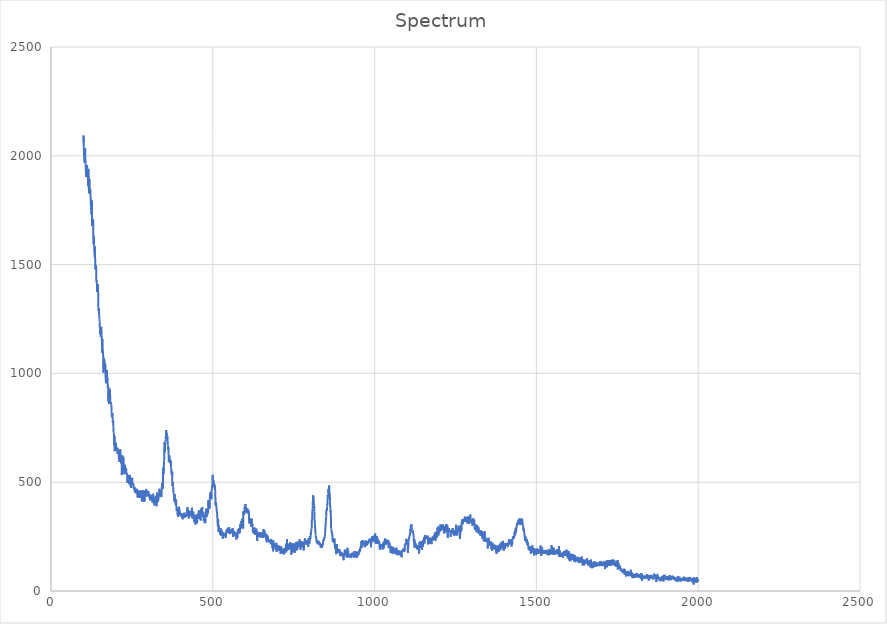
| Category | Spectrum |
|---|---|
| 100.0 | 2060.669 |
| 100.69167 | 2093.079 |
| 101.38332 | 2038.651 |
| 102.07499 | 2003.418 |
| 102.76665 | 1990.29 |
| 103.45832 | 1979.503 |
| 104.14998 | 1967.584 |
| 104.84164 | 2005.34 |
| 105.53331 | 2034.819 |
| 106.22498 | 1983.827 |
| 106.91663 | 1964.356 |
| 107.6083 | 1939.92 |
| 108.29996 | 1903.308 |
| 108.99163 | 1940.898 |
| 109.68329 | 1905.542 |
| 110.37495 | 1957.451 |
| 111.06662 | 1953.255 |
| 111.75829 | 1947.779 |
| 112.44994 | 1944.759 |
| 113.14161 | 1901.045 |
| 113.83327 | 1915.794 |
| 114.52493 | 1862.739 |
| 115.2166 | 1924.685 |
| 115.90826 | 1937.913 |
| 116.59993 | 1880.462 |
| 117.29159 | 1828.373 |
| 117.98325 | 1849.95 |
| 118.67492 | 1892.53 |
| 119.36658 | 1845.512 |
| 120.05824 | 1826.026 |
| 120.74991 | 1840.101 |
| 121.44157 | 1848.503 |
| 122.13324 | 1816.528 |
| 122.8249 | 1801.344 |
| 123.51656 | 1763.043 |
| 124.20823 | 1751.386 |
| 124.89989 | 1729.917 |
| 125.59155 | 1738.966 |
| 126.28322 | 1796.117 |
| 126.97488 | 1677.097 |
| 127.66654 | 1681.862 |
| 128.35822 | 1683 |
| 129.04987 | 1691.173 |
| 129.74153 | 1708.938 |
| 130.4332 | 1699.943 |
| 131.12486 | 1603.884 |
| 131.81653 | 1595.427 |
| 132.50819 | 1629.954 |
| 133.19986 | 1586.966 |
| 133.89153 | 1562.523 |
| 134.58318 | 1563.389 |
| 135.27484 | 1536.543 |
| 135.96651 | 1583.035 |
| 136.65817 | 1486.194 |
| 137.34984 | 1477.481 |
| 138.0415 | 1487.698 |
| 138.73317 | 1496.606 |
| 139.42482 | 1488.011 |
| 140.11649 | 1427.234 |
| 140.80815 | 1423.414 |
| 141.49982 | 1427.916 |
| 142.19148 | 1385.538 |
| 142.88315 | 1373.794 |
| 143.57481 | 1389.38 |
| 144.26648 | 1380.942 |
| 144.95813 | 1410.189 |
| 145.6498 | 1374.033 |
| 146.34146 | 1303.196 |
| 147.03313 | 1287.864 |
| 147.72479 | 1300 |
| 148.41646 | 1290.059 |
| 149.10812 | 1255.666 |
| 149.79977 | 1246.336 |
| 150.49144 | 1238.93 |
| 151.18311 | 1203.133 |
| 151.87477 | 1181.33 |
| 152.56644 | 1186.363 |
| 153.2581 | 1194.689 |
| 153.94977 | 1168.537 |
| 154.64143 | 1199.528 |
| 155.33308 | 1214.484 |
| 156.02475 | 1186.503 |
| 156.71642 | 1162.122 |
| 157.40808 | 1142.733 |
| 158.09975 | 1093.35 |
| 158.79141 | 1158.336 |
| 159.48308 | 1103.729 |
| 160.17474 | 1107.098 |
| 160.86639 | 1100.533 |
| 161.55806 | 1050.695 |
| 162.24973 | 1003.31 |
| 162.94139 | 1062.484 |
| 163.63306 | 1069.717 |
| 164.32472 | 1062.939 |
| 165.01639 | 1059.902 |
| 165.70804 | 1053.103 |
| 166.3997 | 1036.112 |
| 167.09137 | 1019.361 |
| 167.78304 | 1041.879 |
| 168.4747 | 983.18 |
| 169.16637 | 978.833 |
| 169.85803 | 954.608 |
| 170.5497 | 967.212 |
| 171.24135 | 1003.831 |
| 171.93301 | 979.055 |
| 172.62468 | 1016.555 |
| 173.31635 | 956.608 |
| 174.00801 | 981.861 |
| 174.69968 | 966.576 |
| 175.39134 | 932.014 |
| 176.08299 | 931.723 |
| 176.77466 | 941.477 |
| 177.46632 | 869.064 |
| 178.15799 | 920.84 |
| 178.84966 | 895.791 |
| 179.54132 | 859.845 |
| 180.23299 | 875.432 |
| 180.92465 | 930.143 |
| 181.6163 | 926.14 |
| 182.30797 | 918.877 |
| 182.99963 | 884.642 |
| 183.6913 | 862.061 |
| 184.38297 | 859.742 |
| 185.07463 | 864.307 |
| 185.7663 | 860.186 |
| 186.45795 | 857.897 |
| 187.14961 | 824.621 |
| 187.84128 | 806.863 |
| 188.53294 | 798.259 |
| 189.22461 | 809.494 |
| 189.91628 | 817.776 |
| 190.60794 | 789.178 |
| 191.29961 | 771.684 |
| 191.99126 | 784.62 |
| 192.68292 | 757.232 |
| 193.37459 | 729.534 |
| 194.06625 | 724.877 |
| 194.75792 | 716.482 |
| 195.44958 | 669.499 |
| 196.14125 | 712.64 |
| 196.8329 | 642.738 |
| 197.52457 | 668.673 |
| 198.21623 | 674.841 |
| 198.9079 | 671.297 |
| 199.59956 | 683.379 |
| 200.29123 | 681.724 |
| 200.98289 | 646.623 |
| 201.67456 | 660.098 |
| 202.36621 | 651.417 |
| 203.05788 | 658.171 |
| 203.74954 | 658.576 |
| 204.44121 | 645.797 |
| 205.13287 | 657.848 |
| 205.82454 | 629.608 |
| 206.5162 | 652.655 |
| 207.20787 | 646.552 |
| 207.89952 | 638.16 |
| 208.59119 | 641.858 |
| 209.28285 | 639.798 |
| 209.97452 | 602.743 |
| 210.66618 | 614.297 |
| 211.35785 | 593.254 |
| 212.04951 | 629.446 |
| 212.74117 | 637.24 |
| 213.43283 | 638.587 |
| 214.1245 | 651.598 |
| 214.81616 | 621.461 |
| 215.50783 | 625.751 |
| 216.19949 | 607.838 |
| 216.89116 | 586.53 |
| 217.58282 | 601.581 |
| 218.27448 | 581.55 |
| 218.96614 | 534.54 |
| 219.65781 | 599.083 |
| 220.34947 | 608.519 |
| 221.04114 | 622.856 |
| 221.7328 | 596.686 |
| 222.42447 | 571.057 |
| 223.11612 | 584.854 |
| 223.80779 | 613.239 |
| 224.49945 | 583.223 |
| 225.19112 | 553.615 |
| 225.88278 | 557.053 |
| 226.57445 | 536.7 |
| 227.26611 | 551.578 |
| 227.95778 | 579.703 |
| 228.64943 | 578.664 |
| 229.34109 | 544.195 |
| 230.03276 | 542.036 |
| 230.72443 | 547.913 |
| 231.41609 | 565.915 |
| 232.10776 | 562.261 |
| 232.79942 | 546.129 |
| 233.49107 | 537.797 |
| 234.18274 | 541.615 |
| 234.8744 | 530.483 |
| 235.56607 | 527.04 |
| 236.25774 | 496.276 |
| 236.9494 | 516.238 |
| 237.64107 | 533.724 |
| 238.33273 | 529.285 |
| 239.02438 | 527.905 |
| 239.71605 | 512.699 |
| 240.40771 | 504.946 |
| 241.09938 | 501.73 |
| 241.79105 | 490.804 |
| 242.48271 | 507.31 |
| 243.17438 | 533.2 |
| 243.86604 | 530.515 |
| 244.55769 | 511.714 |
| 245.24936 | 521.199 |
| 245.94102 | 480.561 |
| 246.63269 | 484.822 |
| 247.32436 | 480.404 |
| 248.01602 | 473.409 |
| 248.70769 | 488.815 |
| 249.39934 | 510.414 |
| 250.091 | 497.048 |
| 250.78267 | 520.105 |
| 251.47433 | 497.35 |
| 252.166 | 493.044 |
| 252.85767 | 495.538 |
| 253.54933 | 492.391 |
| 254.241 | 496.125 |
| 254.93265 | 481.968 |
| 255.62431 | 478.514 |
| 256.31598 | 466.609 |
| 257.00766 | 470.593 |
| 257.69931 | 478.316 |
| 258.39096 | 470.859 |
| 259.08264 | 454.114 |
| 259.77429 | 470.65 |
| 260.46597 | 457.245 |
| 261.15762 | 461.888 |
| 261.8493 | 448.909 |
| 262.54095 | 459.498 |
| 263.2326 | 468.853 |
| 263.92429 | 459.168 |
| 264.61594 | 470.236 |
| 265.30762 | 468.066 |
| 265.99927 | 453.329 |
| 266.69095 | 457.191 |
| 267.3826 | 430.4 |
| 268.07425 | 433.236 |
| 268.76593 | 462.385 |
| 269.45758 | 449.497 |
| 270.14926 | 427.292 |
| 270.84091 | 435.084 |
| 271.53259 | 459.684 |
| 272.22424 | 452.185 |
| 272.91589 | 455.685 |
| 273.60757 | 458.191 |
| 274.29922 | 446.508 |
| 274.99091 | 461.359 |
| 275.68256 | 428.435 |
| 276.37424 | 449.403 |
| 277.06589 | 459.927 |
| 277.75757 | 458.003 |
| 278.44922 | 456.662 |
| 279.14087 | 459.059 |
| 279.83255 | 450.489 |
| 280.5242 | 412.461 |
| 281.21588 | 411.15 |
| 281.90753 | 435.962 |
| 282.59921 | 421.589 |
| 283.29086 | 437.687 |
| 283.98251 | 462.657 |
| 284.67419 | 448.154 |
| 285.36584 | 421.284 |
| 286.05753 | 431.71 |
| 286.74918 | 427.781 |
| 287.44086 | 411.338 |
| 288.13251 | 421.261 |
| 288.82416 | 413.002 |
| 289.51584 | 411.894 |
| 290.20749 | 461.346 |
| 290.89917 | 457.782 |
| 291.59082 | 446.49 |
| 292.2825 | 432.397 |
| 292.97415 | 448.237 |
| 293.6658 | 460.403 |
| 294.35748 | 466.731 |
| 295.04913 | 466.886 |
| 295.74081 | 450.579 |
| 296.43246 | 451.068 |
| 297.12415 | 456.29 |
| 297.8158 | 455.497 |
| 298.50748 | 447.54 |
| 299.19913 | 434.639 |
| 299.89078 | 435.774 |
| 300.58246 | 454.98 |
| 301.27411 | 459.197 |
| 301.96579 | 439.589 |
| 302.65744 | 434.366 |
| 303.34912 | 434.225 |
| 304.04077 | 433.624 |
| 304.73242 | 427.052 |
| 305.4241 | 421.971 |
| 306.11575 | 429.901 |
| 306.80743 | 443.28 |
| 307.49908 | 415.807 |
| 308.19077 | 429.478 |
| 308.88242 | 421.003 |
| 309.57407 | 433.914 |
| 310.26575 | 437.971 |
| 310.9574 | 429.134 |
| 311.64908 | 440.047 |
| 312.34073 | 434.701 |
| 313.03241 | 419.421 |
| 313.72406 | 406.931 |
| 314.41574 | 429.204 |
| 315.10739 | 446.826 |
| 315.79904 | 444.459 |
| 316.49072 | 431.488 |
| 317.18237 | 419.342 |
| 317.87405 | 402.528 |
| 318.5657 | 419.123 |
| 319.25739 | 411.714 |
| 319.94904 | 393.149 |
| 320.64069 | 406.125 |
| 321.33237 | 423.237 |
| 322.02402 | 415.507 |
| 322.7157 | 410.562 |
| 323.40735 | 437.563 |
| 324.09903 | 413.084 |
| 324.79068 | 435.607 |
| 325.48233 | 407.424 |
| 326.17401 | 389.565 |
| 326.86566 | 398.591 |
| 327.55734 | 421.318 |
| 328.24899 | 452.397 |
| 328.94067 | 429.504 |
| 329.63232 | 429.058 |
| 330.32397 | 408.453 |
| 331.01566 | 415.36 |
| 331.70731 | 419.931 |
| 332.39899 | 426.672 |
| 333.09064 | 439.773 |
| 333.78232 | 435.992 |
| 334.47397 | 451.788 |
| 335.16565 | 469.733 |
| 335.8573 | 449.432 |
| 336.54895 | 444.105 |
| 337.24063 | 445.779 |
| 337.93228 | 441.018 |
| 338.62396 | 436.806 |
| 339.31561 | 450.248 |
| 340.00729 | 459.837 |
| 340.69894 | 432.217 |
| 341.39059 | 431.718 |
| 342.08228 | 464.743 |
| 342.77393 | 480.683 |
| 343.46561 | 486.823 |
| 344.15726 | 498.643 |
| 344.84894 | 495.651 |
| 345.54059 | 468.242 |
| 346.23224 | 543.694 |
| 346.92392 | 566.057 |
| 347.61557 | 536.5 |
| 348.30725 | 558.066 |
| 348.9989 | 583.338 |
| 349.69058 | 599.256 |
| 350.38223 | 660.978 |
| 351.07391 | 684.833 |
| 351.76556 | 637.805 |
| 352.45721 | 665.128 |
| 353.1489 | 682.425 |
| 353.84055 | 687.573 |
| 354.53223 | 695.231 |
| 355.22388 | 718.544 |
| 355.91556 | 739.83 |
| 356.60721 | 710.695 |
| 357.29886 | 727.395 |
| 357.99054 | 704.712 |
| 358.68219 | 695.782 |
| 359.37387 | 711.261 |
| 360.06552 | 697.995 |
| 360.7572 | 673.648 |
| 361.44885 | 669.285 |
| 362.1405 | 648.742 |
| 362.83218 | 660.834 |
| 363.52383 | 625.169 |
| 364.21552 | 592.58 |
| 364.90717 | 622.053 |
| 365.59885 | 624.076 |
| 366.2905 | 614.316 |
| 366.98215 | 613.964 |
| 367.67383 | 587.762 |
| 368.36548 | 594.317 |
| 369.05716 | 600.049 |
| 369.74881 | 600.509 |
| 370.44049 | 599.466 |
| 371.13214 | 568.641 |
| 371.82382 | 546.231 |
| 372.51547 | 542.487 |
| 373.20712 | 533.53 |
| 373.8988 | 531.923 |
| 374.59045 | 549.139 |
| 375.28214 | 483.097 |
| 375.97379 | 499.692 |
| 376.66547 | 495.208 |
| 377.35712 | 478.862 |
| 378.04877 | 462.989 |
| 378.74045 | 449.823 |
| 379.4321 | 448.156 |
| 380.12378 | 448.18 |
| 380.81543 | 429.653 |
| 381.50711 | 410.299 |
| 382.19876 | 444.488 |
| 382.89041 | 433.765 |
| 383.58209 | 406.834 |
| 384.27374 | 409.43 |
| 384.96542 | 419.956 |
| 385.65707 | 394.718 |
| 386.34875 | 422.124 |
| 387.04041 | 401.587 |
| 387.73209 | 377.365 |
| 388.42374 | 368.905 |
| 389.11539 | 380.032 |
| 389.80707 | 382.857 |
| 390.49872 | 364.728 |
| 391.1904 | 351.007 |
| 391.88205 | 356.915 |
| 392.57373 | 340.985 |
| 393.26538 | 344.976 |
| 393.95703 | 353.858 |
| 394.64871 | 379.187 |
| 395.34036 | 387.465 |
| 396.03204 | 379.952 |
| 396.72369 | 377.091 |
| 397.41537 | 369.048 |
| 398.10703 | 354.237 |
| 398.79868 | 362.2 |
| 399.49036 | 347.466 |
| 400.18201 | 345.559 |
| 400.87369 | 353.332 |
| 401.56534 | 348.06 |
| 402.25702 | 344.708 |
| 402.94867 | 357.624 |
| 403.64032 | 341.681 |
| 404.332 | 346.995 |
| 405.02365 | 334.597 |
| 405.71533 | 343.047 |
| 406.40698 | 334.46 |
| 407.09866 | 332.059 |
| 407.79031 | 341.069 |
| 408.48199 | 346.759 |
| 409.17365 | 345.218 |
| 409.8653 | 355.421 |
| 410.55698 | 335.895 |
| 411.24863 | 359.874 |
| 411.94031 | 355.544 |
| 412.63196 | 349.125 |
| 413.32364 | 337.664 |
| 414.01529 | 340.043 |
| 414.70694 | 350.338 |
| 415.39862 | 342.97 |
| 416.09027 | 351 |
| 416.78195 | 351 |
| 417.4736 | 351.862 |
| 418.16528 | 340.366 |
| 418.85693 | 356.658 |
| 419.54858 | 363.242 |
| 420.24026 | 351.482 |
| 420.93192 | 356.185 |
| 421.6236 | 385.513 |
| 422.31525 | 365.724 |
| 423.00693 | 373.292 |
| 423.69858 | 345.423 |
| 424.39026 | 370.386 |
| 425.08191 | 358.461 |
| 425.77356 | 333.72 |
| 426.46524 | 343.854 |
| 427.15689 | 363.306 |
| 427.84857 | 347.272 |
| 428.54022 | 368 |
| 429.2319 | 368 |
| 429.92355 | 358.836 |
| 430.6152 | 364.394 |
| 431.30688 | 357.651 |
| 431.99854 | 343.712 |
| 432.69022 | 344.306 |
| 433.38187 | 350.903 |
| 434.07355 | 343.274 |
| 434.7652 | 350.016 |
| 435.45685 | 382.491 |
| 436.14853 | 368.214 |
| 436.84018 | 333.141 |
| 437.53186 | 332.793 |
| 438.22351 | 341.544 |
| 438.91519 | 353.048 |
| 439.60684 | 361.275 |
| 440.29849 | 359.369 |
| 440.99017 | 356.076 |
| 441.68182 | 327.716 |
| 442.3735 | 318.794 |
| 443.06516 | 316.374 |
| 443.75684 | 332.239 |
| 444.44849 | 345.893 |
| 445.14017 | 345.836 |
| 445.83182 | 324.465 |
| 446.52347 | 305.649 |
| 447.21515 | 325.593 |
| 447.9068 | 327.694 |
| 448.59848 | 351.397 |
| 449.29013 | 346.117 |
| 449.98181 | 329.365 |
| 450.67346 | 311.227 |
| 451.36511 | 313.053 |
| 452.05679 | 328.035 |
| 452.74844 | 339.11 |
| 453.44012 | 346.16 |
| 454.13177 | 356.469 |
| 454.82346 | 331.527 |
| 455.51511 | 337.793 |
| 456.20676 | 346.429 |
| 456.89844 | 369.809 |
| 457.59009 | 348.091 |
| 458.28177 | 335.523 |
| 458.97342 | 341.301 |
| 459.6651 | 332.373 |
| 460.35675 | 335.336 |
| 461.04843 | 353.719 |
| 461.74008 | 372.535 |
| 462.43173 | 324.282 |
| 463.12341 | 352.005 |
| 463.81506 | 378.598 |
| 464.50674 | 373.636 |
| 465.19839 | 365.536 |
| 465.89008 | 366.225 |
| 466.58173 | 366.481 |
| 467.27338 | 386.099 |
| 467.96506 | 354.115 |
| 468.65671 | 359.948 |
| 469.34839 | 340.24 |
| 470.04004 | 348.253 |
| 470.73172 | 363.788 |
| 471.42337 | 344.927 |
| 472.11502 | 322.496 |
| 472.8067 | 334.391 |
| 473.49835 | 349.873 |
| 474.19003 | 338.266 |
| 474.88168 | 311.36 |
| 475.57336 | 320.312 |
| 476.26501 | 328.567 |
| 476.95667 | 314.831 |
| 477.64835 | 337.936 |
| 478.34 | 349.003 |
| 479.03168 | 354.328 |
| 479.72333 | 378.599 |
| 480.41501 | 361.985 |
| 481.10666 | 339.616 |
| 481.79834 | 359.851 |
| 482.48999 | 367.886 |
| 483.18164 | 377.446 |
| 483.87332 | 361.322 |
| 484.56497 | 355.965 |
| 485.25665 | 359.703 |
| 485.9483 | 385.515 |
| 486.63998 | 418.176 |
| 487.33163 | 391.767 |
| 488.02328 | 410.141 |
| 488.71497 | 398 |
| 489.40662 | 403.979 |
| 490.0983 | 378.262 |
| 490.78995 | 422.085 |
| 491.48163 | 447.659 |
| 492.17328 | 444.453 |
| 492.86493 | 448.07 |
| 493.55661 | 456.327 |
| 494.24826 | 445.931 |
| 494.93994 | 436.863 |
| 495.63159 | 421.546 |
| 496.32327 | 458.81 |
| 497.01492 | 471.819 |
| 497.7066 | 474.342 |
| 498.39825 | 471.353 |
| 499.0899 | 508.621 |
| 499.78159 | 534.459 |
| 500.47324 | 497.146 |
| 501.16492 | 484.105 |
| 501.85657 | 509.149 |
| 502.54825 | 477.578 |
| 503.2399 | 481.428 |
| 503.93155 | 489.492 |
| 504.62323 | 493.918 |
| 505.31488 | 483.148 |
| 506.00656 | 483.913 |
| 506.69821 | 482.861 |
| 507.38989 | 456.392 |
| 508.08154 | 422.376 |
| 508.77319 | 392.422 |
| 509.46487 | 408.431 |
| 510.15652 | 400.745 |
| 510.84821 | 388.181 |
| 511.53986 | 378.664 |
| 512.23151 | 366.645 |
| 512.92322 | 360.473 |
| 513.61487 | 350.31 |
| 514.30652 | 330.646 |
| 514.99817 | 311.399 |
| 515.68982 | 298.922 |
| 516.38153 | 330.3 |
| 517.07318 | 306.762 |
| 517.76483 | 272.541 |
| 518.45648 | 301.22 |
| 519.14813 | 281.752 |
| 519.83984 | 281.335 |
| 520.53149 | 278.481 |
| 521.22314 | 273.458 |
| 521.91479 | 282.953 |
| 522.60651 | 262.765 |
| 523.29816 | 258.761 |
| 523.98981 | 270.538 |
| 524.68146 | 288.645 |
| 525.37311 | 265.702 |
| 526.06482 | 252.812 |
| 526.75647 | 274.672 |
| 527.44812 | 280.486 |
| 528.13977 | 267.042 |
| 528.83148 | 259.832 |
| 529.52313 | 261.255 |
| 530.21478 | 262.132 |
| 530.90643 | 240.323 |
| 531.59808 | 266.606 |
| 532.28979 | 270.138 |
| 532.98145 | 254.85 |
| 533.6731 | 251.539 |
| 534.36475 | 257.682 |
| 535.0564 | 261.005 |
| 535.74811 | 259.887 |
| 536.43976 | 258.681 |
| 537.13141 | 259.477 |
| 537.82306 | 263.699 |
| 538.51477 | 258.509 |
| 539.20642 | 258.509 |
| 539.89807 | 243.914 |
| 540.58972 | 252.249 |
| 541.28137 | 262.261 |
| 541.97308 | 276.599 |
| 542.66473 | 279.096 |
| 543.35638 | 272.103 |
| 544.04803 | 275.269 |
| 544.73975 | 286.124 |
| 545.4314 | 281.79 |
| 546.12305 | 274.194 |
| 546.8147 | 290.995 |
| 547.50635 | 280.025 |
| 548.19806 | 275.329 |
| 548.88971 | 266.417 |
| 549.58136 | 285.287 |
| 550.27301 | 293.853 |
| 550.96466 | 277.531 |
| 551.65637 | 261.863 |
| 552.34802 | 261.493 |
| 553.03967 | 283.332 |
| 553.73132 | 278.536 |
| 554.42303 | 268.981 |
| 555.11469 | 281.042 |
| 555.80634 | 279.517 |
| 556.49799 | 278.16 |
| 557.18964 | 275.913 |
| 557.88135 | 273.492 |
| 558.573 | 272.929 |
| 559.26465 | 272.679 |
| 559.9563 | 268.087 |
| 560.64795 | 263.936 |
| 561.33966 | 289.537 |
| 562.03131 | 269.027 |
| 562.72296 | 248.498 |
| 563.41461 | 263.232 |
| 564.10632 | 270.713 |
| 564.79797 | 266.687 |
| 565.48962 | 271.573 |
| 566.18127 | 272.216 |
| 566.87292 | 264.147 |
| 567.56464 | 265.434 |
| 568.25629 | 267.504 |
| 568.94794 | 255.417 |
| 569.63959 | 263.371 |
| 570.3313 | 254.239 |
| 571.02295 | 250.988 |
| 571.7146 | 268.194 |
| 572.40625 | 253.353 |
| 573.0979 | 236.34 |
| 573.78961 | 250.989 |
| 574.48126 | 268.765 |
| 575.17291 | 258.448 |
| 575.86456 | 244.684 |
| 576.55621 | 253.652 |
| 577.24792 | 282.842 |
| 577.93958 | 280.565 |
| 578.63123 | 269.805 |
| 579.32288 | 278.995 |
| 580.01459 | 276.461 |
| 580.70624 | 288.5 |
| 581.39789 | 275.85 |
| 582.08954 | 266.689 |
| 582.78119 | 268.834 |
| 583.4729 | 266.173 |
| 584.16455 | 290.181 |
| 584.8562 | 307.893 |
| 585.54785 | 309.387 |
| 586.23956 | 285.584 |
| 586.93121 | 295.431 |
| 587.62286 | 292.259 |
| 588.31451 | 322.066 |
| 589.00616 | 314.449 |
| 589.69788 | 320.611 |
| 590.38953 | 329.221 |
| 591.08118 | 326.269 |
| 591.77283 | 330.96 |
| 592.46448 | 318.509 |
| 593.15619 | 314.261 |
| 593.84784 | 286.934 |
| 594.53949 | 367.149 |
| 595.23114 | 354.415 |
| 595.92285 | 359.9 |
| 596.6145 | 350.673 |
| 597.30615 | 349.446 |
| 597.9978 | 373.221 |
| 598.68945 | 388.745 |
| 599.38116 | 375.277 |
| 600.07281 | 373.044 |
| 600.76447 | 400.221 |
| 601.45612 | 375.098 |
| 602.14783 | 384.276 |
| 602.83948 | 362.241 |
| 603.53113 | 359.282 |
| 604.22278 | 372.717 |
| 604.91443 | 375.644 |
| 605.60614 | 367.127 |
| 606.29779 | 373.498 |
| 606.98944 | 379.351 |
| 607.68109 | 370.885 |
| 608.37274 | 364.917 |
| 609.06445 | 365.428 |
| 609.7561 | 354.456 |
| 610.44775 | 371.789 |
| 611.1394 | 363.501 |
| 611.83112 | 344.192 |
| 612.52277 | 314.776 |
| 613.21442 | 310.27 |
| 613.90607 | 330.251 |
| 614.59772 | 332.899 |
| 615.28943 | 331.639 |
| 615.98108 | 331.189 |
| 616.67273 | 324.823 |
| 617.36438 | 320.293 |
| 618.05609 | 313.604 |
| 618.74774 | 295.642 |
| 619.43939 | 304.905 |
| 620.13104 | 332.558 |
| 620.82269 | 297.945 |
| 621.5144 | 302.828 |
| 622.20605 | 308.665 |
| 622.89771 | 301.825 |
| 623.58936 | 274.452 |
| 624.28101 | 269.726 |
| 624.97272 | 289.575 |
| 625.66437 | 285.435 |
| 626.35602 | 266.272 |
| 627.04767 | 284.867 |
| 627.73938 | 262.601 |
| 628.43103 | 279.559 |
| 629.12268 | 280.935 |
| 629.81433 | 288.907 |
| 630.50598 | 288.397 |
| 631.19769 | 257.91 |
| 631.88934 | 272.78 |
| 632.58099 | 261.562 |
| 633.27264 | 262.311 |
| 633.96429 | 286.904 |
| 634.65601 | 285.63 |
| 635.34766 | 273.508 |
| 636.03931 | 272.538 |
| 636.73096 | 243.114 |
| 637.42267 | 230.333 |
| 638.11432 | 273.786 |
| 638.80597 | 247.095 |
| 639.49762 | 265.453 |
| 640.18927 | 266.826 |
| 640.88098 | 263.85 |
| 641.57263 | 256.849 |
| 642.26428 | 251.486 |
| 642.95593 | 254.877 |
| 643.64764 | 257.612 |
| 644.33929 | 254.951 |
| 645.03094 | 263.454 |
| 645.7226 | 269.8 |
| 646.41425 | 252.645 |
| 647.10596 | 247.561 |
| 647.79761 | 246.126 |
| 648.48926 | 268.339 |
| 649.18091 | 246.743 |
| 649.87256 | 265.773 |
| 650.56427 | 261.651 |
| 651.25592 | 265.437 |
| 651.94757 | 260.839 |
| 652.63922 | 247.321 |
| 653.33093 | 257.765 |
| 654.02258 | 266.358 |
| 654.71423 | 262.088 |
| 655.40588 | 256.192 |
| 656.09753 | 243.153 |
| 656.78925 | 284.411 |
| 657.4809 | 253.896 |
| 658.17255 | 249.598 |
| 658.8642 | 255.486 |
| 659.55591 | 278.087 |
| 660.24756 | 259.032 |
| 660.93921 | 260.487 |
| 661.63086 | 267.466 |
| 662.32251 | 260.335 |
| 663.01422 | 262.064 |
| 663.70587 | 247.226 |
| 664.39752 | 247.436 |
| 665.08917 | 233.873 |
| 665.78082 | 261.691 |
| 666.47253 | 224.081 |
| 667.16418 | 250.104 |
| 667.85583 | 251.049 |
| 668.54749 | 238.883 |
| 669.2392 | 254.357 |
| 669.93085 | 240.082 |
| 670.6225 | 238.199 |
| 671.31415 | 242.011 |
| 672.0058 | 229.323 |
| 672.69751 | 227.272 |
| 673.38916 | 232.629 |
| 674.08081 | 225.369 |
| 674.77246 | 234.911 |
| 675.46417 | 230.306 |
| 676.15582 | 226.584 |
| 676.84747 | 225.598 |
| 677.53912 | 228.04 |
| 678.23077 | 221.147 |
| 678.92249 | 218.654 |
| 679.61414 | 226.15 |
| 680.30579 | 239.032 |
| 680.99744 | 228.515 |
| 681.68909 | 219.711 |
| 682.3808 | 228.871 |
| 683.07245 | 228.66 |
| 683.7641 | 224.655 |
| 684.45575 | 197.027 |
| 685.14746 | 231.504 |
| 685.83911 | 182.247 |
| 686.53076 | 191.567 |
| 687.22241 | 230.716 |
| 687.91406 | 218.244 |
| 688.60577 | 215.265 |
| 689.29742 | 210.694 |
| 689.98907 | 214.722 |
| 690.68073 | 208.532 |
| 691.37244 | 204.649 |
| 692.06409 | 211.526 |
| 692.75574 | 211.283 |
| 693.44739 | 199.893 |
| 694.13904 | 188.955 |
| 694.83075 | 190.977 |
| 695.5224 | 196.04 |
| 696.21405 | 221.272 |
| 696.9057 | 212.395 |
| 697.59735 | 179.404 |
| 698.28906 | 196.213 |
| 698.98071 | 205.083 |
| 699.67236 | 207.206 |
| 700.36401 | 199.922 |
| 701.05573 | 196.354 |
| 701.74738 | 202.776 |
| 702.43903 | 202.6 |
| 703.13068 | 202.461 |
| 703.82233 | 209.297 |
| 704.51404 | 193.101 |
| 705.20569 | 185.469 |
| 705.89734 | 197.326 |
| 706.58899 | 185.052 |
| 707.28064 | 194.874 |
| 707.97235 | 203.78 |
| 708.664 | 196.772 |
| 709.35565 | 170.026 |
| 710.0473 | 173.772 |
| 710.73901 | 192.917 |
| 711.43066 | 204.15 |
| 712.12231 | 204.603 |
| 712.81396 | 191.004 |
| 713.50562 | 176.544 |
| 714.19733 | 177.345 |
| 714.88898 | 180.317 |
| 715.58063 | 179.019 |
| 716.27228 | 192.342 |
| 716.96399 | 189.095 |
| 717.65564 | 169.454 |
| 718.34729 | 190.09 |
| 719.03894 | 182.238 |
| 719.73059 | 194.789 |
| 720.4223 | 168.761 |
| 721.11395 | 173.989 |
| 721.8056 | 197.344 |
| 722.49725 | 179.61 |
| 723.1889 | 178.732 |
| 723.88062 | 179.286 |
| 724.57227 | 174.777 |
| 725.26392 | 197.521 |
| 725.95557 | 210.384 |
| 726.64728 | 201.912 |
| 727.33893 | 218.23 |
| 728.03058 | 212.201 |
| 728.72223 | 182.496 |
| 729.41388 | 239.23 |
| 730.10559 | 187.536 |
| 730.79724 | 211.057 |
| 731.48889 | 195.94 |
| 732.18054 | 212.659 |
| 732.87225 | 216.884 |
| 733.5639 | 202.751 |
| 734.25555 | 189.046 |
| 734.9472 | 197.445 |
| 735.63885 | 212.282 |
| 736.33057 | 210.674 |
| 737.02222 | 211.253 |
| 737.71387 | 215.673 |
| 738.40552 | 198.635 |
| 739.09717 | 223.771 |
| 739.78888 | 200.685 |
| 740.48053 | 194.747 |
| 741.17218 | 198.52 |
| 741.86383 | 209.821 |
| 742.55554 | 167.122 |
| 743.24719 | 177.232 |
| 743.93884 | 180.509 |
| 744.63049 | 215.422 |
| 745.32214 | 219.349 |
| 746.01385 | 208.927 |
| 746.70551 | 188.211 |
| 747.39716 | 177.863 |
| 748.08881 | 203.634 |
| 748.78052 | 215.896 |
| 749.47217 | 195.875 |
| 750.16382 | 214.705 |
| 750.85547 | 216.895 |
| 751.54712 | 197.457 |
| 752.23883 | 211.517 |
| 752.93048 | 175.699 |
| 753.62213 | 181.367 |
| 754.31378 | 199.911 |
| 755.00543 | 218.366 |
| 755.69714 | 202.808 |
| 756.38879 | 223.754 |
| 757.08044 | 217.339 |
| 757.77209 | 213.9 |
| 758.46381 | 205.517 |
| 759.15546 | 207.829 |
| 759.84711 | 194.711 |
| 760.53876 | 186.765 |
| 761.23041 | 219.129 |
| 761.92212 | 226.893 |
| 762.61377 | 199.73 |
| 763.30542 | 201.319 |
| 763.99707 | 214.935 |
| 764.68878 | 209.245 |
| 765.38043 | 211.333 |
| 766.07208 | 207.547 |
| 766.76373 | 217.809 |
| 767.45538 | 222.925 |
| 768.14709 | 237.198 |
| 768.83875 | 209.348 |
| 769.5304 | 217.142 |
| 770.22205 | 199.033 |
| 770.9137 | 189.786 |
| 771.60541 | 201.385 |
| 772.29706 | 220.008 |
| 772.98871 | 226.834 |
| 773.68036 | 207.44 |
| 774.37207 | 202.36 |
| 775.06372 | 228.623 |
| 775.75537 | 213.755 |
| 776.44702 | 201.892 |
| 777.13867 | 213.126 |
| 777.83038 | 222.938 |
| 778.52203 | 225.769 |
| 779.21368 | 199.237 |
| 779.90533 | 220.629 |
| 780.59698 | 190.437 |
| 781.2887 | 186.509 |
| 781.98035 | 217.221 |
| 782.672 | 222.562 |
| 783.36365 | 221.16 |
| 784.05536 | 232.13 |
| 784.74701 | 242.606 |
| 785.43866 | 227.322 |
| 786.13031 | 219.503 |
| 786.82196 | 226.261 |
| 787.51367 | 219.384 |
| 788.20532 | 216.188 |
| 788.89697 | 219.518 |
| 789.58862 | 213.241 |
| 790.28033 | 229.791 |
| 790.97198 | 216.375 |
| 791.66364 | 233.028 |
| 792.35529 | 217.32 |
| 793.04694 | 212.565 |
| 793.73865 | 232.708 |
| 794.4303 | 217.071 |
| 795.12195 | 202.795 |
| 795.8136 | 240.985 |
| 796.50525 | 229.901 |
| 797.19696 | 242.358 |
| 797.88861 | 242.562 |
| 798.58026 | 217.845 |
| 799.27191 | 232.633 |
| 799.96362 | 251.811 |
| 800.65527 | 247.294 |
| 801.34692 | 239.92 |
| 802.03857 | 248.149 |
| 802.73022 | 266.647 |
| 803.42194 | 260.354 |
| 804.11359 | 278.819 |
| 804.80524 | 284.718 |
| 805.49689 | 288.313 |
| 806.1886 | 328.865 |
| 806.88025 | 321.866 |
| 807.5719 | 368.03 |
| 808.26355 | 374.255 |
| 808.9552 | 391.571 |
| 809.64691 | 439.652 |
| 810.33856 | 436.847 |
| 811.03021 | 434.983 |
| 811.72186 | 426.282 |
| 812.41351 | 402.984 |
| 813.10522 | 391.852 |
| 813.79688 | 365.684 |
| 814.48853 | 332.183 |
| 815.18018 | 312.015 |
| 815.87189 | 298.691 |
| 816.56354 | 285.068 |
| 817.25519 | 259.332 |
| 817.94684 | 255.929 |
| 818.63849 | 246.171 |
| 819.3302 | 247.052 |
| 820.02185 | 237.367 |
| 820.7135 | 226.154 |
| 821.40515 | 232.783 |
| 822.09686 | 223.531 |
| 822.78851 | 219.549 |
| 823.48016 | 224.544 |
| 824.17181 | 228.674 |
| 824.86346 | 218.512 |
| 825.55518 | 217.533 |
| 826.24683 | 223.58 |
| 826.93848 | 228.021 |
| 827.63013 | 221.013 |
| 828.32178 | 226.048 |
| 829.01349 | 217.797 |
| 829.70514 | 211.73 |
| 830.39679 | 218.362 |
| 831.08844 | 219.485 |
| 831.78015 | 211.45 |
| 832.4718 | 209.47 |
| 833.16345 | 201.849 |
| 833.8551 | 200.439 |
| 834.54675 | 216.396 |
| 835.23846 | 199.496 |
| 835.93011 | 208.773 |
| 836.62177 | 211.705 |
| 837.31342 | 198.826 |
| 838.00513 | 200.598 |
| 838.69678 | 216.755 |
| 839.38843 | 213.249 |
| 840.08008 | 213.38 |
| 840.77173 | 223.381 |
| 841.46344 | 234.017 |
| 842.15509 | 233.933 |
| 842.84674 | 234.859 |
| 843.53839 | 235.289 |
| 844.23004 | 246.956 |
| 844.92175 | 243.879 |
| 845.6134 | 247.273 |
| 846.30505 | 249.202 |
| 846.9967 | 263.06 |
| 847.68842 | 283.955 |
| 848.38007 | 300.131 |
| 849.07172 | 316.472 |
| 849.76337 | 322.339 |
| 850.45502 | 341.935 |
| 851.14673 | 374.892 |
| 851.83838 | 372.978 |
| 852.53003 | 368.799 |
| 853.22168 | 388.71 |
| 853.91333 | 398.239 |
| 854.60504 | 408.814 |
| 855.29669 | 441.26 |
| 855.98834 | 431.806 |
| 856.67999 | 436.891 |
| 857.3717 | 469.126 |
| 858.06335 | 453.599 |
| 858.755 | 472.226 |
| 859.44666 | 484.98 |
| 860.13831 | 459.04 |
| 860.83002 | 441.087 |
| 861.52167 | 445.543 |
| 862.21332 | 410.407 |
| 862.90497 | 377.544 |
| 863.59668 | 365.371 |
| 864.28833 | 368.195 |
| 864.97998 | 340.004 |
| 865.67163 | 287.459 |
| 866.36328 | 282.228 |
| 867.05499 | 277.023 |
| 867.74664 | 263.633 |
| 868.43829 | 266.421 |
| 869.12994 | 261.701 |
| 869.82159 | 248.151 |
| 870.51331 | 230.341 |
| 871.20496 | 225.018 |
| 871.89661 | 236.181 |
| 872.58826 | 237.725 |
| 873.27997 | 230.618 |
| 873.97162 | 234.912 |
| 874.66327 | 234.493 |
| 875.35492 | 221.712 |
| 876.04657 | 240.764 |
| 876.73828 | 206.215 |
| 877.42993 | 201.291 |
| 878.12158 | 211.648 |
| 878.81323 | 191.789 |
| 879.50494 | 216.168 |
| 880.19659 | 201.382 |
| 880.88824 | 169.238 |
| 881.5799 | 184.863 |
| 882.27155 | 199.13 |
| 882.96326 | 216.312 |
| 883.65491 | 210.996 |
| 884.34656 | 194.074 |
| 885.03821 | 182.988 |
| 885.72986 | 173.761 |
| 886.42157 | 178.825 |
| 887.11322 | 189.32 |
| 887.80487 | 189.022 |
| 888.49652 | 186.623 |
| 889.18823 | 175.47 |
| 889.87988 | 181.712 |
| 890.57153 | 183.591 |
| 891.26318 | 192.509 |
| 891.95483 | 181.191 |
| 892.64655 | 182.193 |
| 893.3382 | 164.581 |
| 894.02985 | 178.615 |
| 894.7215 | 168.013 |
| 895.41321 | 159.296 |
| 896.10486 | 175.312 |
| 896.79651 | 180.486 |
| 897.48816 | 172.474 |
| 898.17981 | 174.153 |
| 898.87152 | 173.473 |
| 899.56317 | 171.388 |
| 900.25482 | 161.088 |
| 900.94647 | 173.366 |
| 901.63812 | 171.284 |
| 902.32983 | 169.025 |
| 903.02148 | 171.882 |
| 903.71313 | 141.921 |
| 904.40479 | 141.383 |
| 905.0965 | 166.757 |
| 905.78815 | 162.288 |
| 906.4798 | 166.791 |
| 907.17145 | 177.754 |
| 907.8631 | 190.272 |
| 908.55481 | 189.635 |
| 909.24646 | 169.974 |
| 909.93811 | 177.205 |
| 910.62976 | 178.121 |
| 911.32141 | 174.289 |
| 912.01312 | 169.02 |
| 912.70477 | 161 |
| 913.39642 | 160.83 |
| 914.08807 | 157.266 |
| 914.77979 | 184.344 |
| 915.47144 | 152.712 |
| 916.16309 | 199.071 |
| 916.85474 | 182.702 |
| 917.54639 | 178.094 |
| 918.2381 | 185.118 |
| 918.92975 | 167.221 |
| 919.6214 | 167.79 |
| 920.31305 | 166.912 |
| 921.00476 | 158.381 |
| 921.69641 | 161.408 |
| 922.38806 | 162.917 |
| 923.07971 | 163.687 |
| 923.77136 | 156.468 |
| 924.46307 | 156.675 |
| 925.15472 | 158.297 |
| 925.84637 | 161.369 |
| 926.53802 | 171.653 |
| 927.22968 | 168.911 |
| 927.92139 | 157.648 |
| 928.61304 | 155.352 |
| 929.30469 | 162.425 |
| 929.99634 | 165.269 |
| 930.68805 | 175.836 |
| 931.3797 | 160.561 |
| 932.07135 | 162.129 |
| 932.763 | 171.16 |
| 933.45465 | 169.2 |
| 934.14636 | 175.207 |
| 934.83801 | 163.236 |
| 935.52966 | 176.78 |
| 936.22131 | 153.584 |
| 936.91302 | 182.705 |
| 937.60468 | 158.741 |
| 938.29633 | 153.32 |
| 938.98798 | 164.561 |
| 939.67963 | 158.775 |
| 940.37134 | 181.525 |
| 941.06299 | 183.326 |
| 941.75464 | 176.451 |
| 942.44629 | 164.26 |
| 943.13794 | 163.944 |
| 943.82965 | 168.541 |
| 944.5213 | 172.578 |
| 945.21295 | 162.023 |
| 945.9046 | 152.788 |
| 946.59631 | 170.774 |
| 947.28796 | 180.566 |
| 947.97961 | 172.43 |
| 948.67126 | 171.009 |
| 949.36292 | 171.927 |
| 950.05463 | 165.598 |
| 950.74628 | 165.615 |
| 951.43793 | 179.625 |
| 952.12958 | 183.442 |
| 952.82129 | 176.907 |
| 953.51294 | 188.604 |
| 954.20459 | 190.086 |
| 954.89624 | 181.847 |
| 955.58789 | 186.586 |
| 956.2796 | 200.996 |
| 956.97125 | 203.344 |
| 957.6629 | 196.961 |
| 958.35455 | 202.586 |
| 959.0462 | 228.766 |
| 959.73792 | 197.303 |
| 960.42957 | 211.732 |
| 961.12122 | 230.231 |
| 961.81287 | 218.323 |
| 962.50458 | 233.908 |
| 963.19623 | 224.146 |
| 963.88788 | 224.755 |
| 964.57953 | 216.354 |
| 965.27118 | 230.597 |
| 965.96289 | 223.098 |
| 966.65454 | 212.29 |
| 967.34619 | 224.269 |
| 968.03784 | 214.491 |
| 968.72955 | 204.785 |
| 969.4212 | 204.381 |
| 970.11285 | 210.037 |
| 970.8045 | 202.326 |
| 971.49615 | 207.954 |
| 972.18787 | 223.396 |
| 972.87952 | 232.887 |
| 973.57117 | 229.764 |
| 974.26282 | 220.762 |
| 974.95447 | 224.125 |
| 975.64618 | 217.438 |
| 976.33783 | 209.336 |
| 977.02948 | 214.017 |
| 977.72113 | 216.372 |
| 978.41284 | 219.856 |
| 979.10449 | 219.798 |
| 979.79614 | 221.757 |
| 980.48779 | 229.677 |
| 981.17944 | 221.572 |
| 981.87115 | 225.659 |
| 982.56281 | 236.288 |
| 983.25446 | 227.234 |
| 983.94611 | 240.105 |
| 984.63776 | 240.551 |
| 985.32947 | 239.94 |
| 986.02112 | 236.737 |
| 986.71277 | 228.427 |
| 987.40442 | 231.757 |
| 988.09613 | 230.256 |
| 988.78778 | 201.216 |
| 989.47943 | 225.16 |
| 990.17108 | 225.264 |
| 990.86273 | 223.616 |
| 991.55444 | 244.822 |
| 992.24609 | 250.722 |
| 992.93774 | 236.058 |
| 993.62939 | 226.498 |
| 994.32111 | 241.104 |
| 995.01276 | 251.674 |
| 995.70441 | 241.087 |
| 996.39606 | 233.211 |
| 997.08771 | 240.44 |
| 997.77942 | 243.602 |
| 998.47107 | 254.835 |
| 999.16272 | 227.793 |
| 999.85437 | 236.294 |
| 1000.546 | 248.384 |
| 1001.2377 | 248.3 |
| 1001.9294 | 264.678 |
| 1002.621 | 227.8 |
| 1003.3127 | 218.786 |
| 1004.0044 | 233.043 |
| 1004.696 | 230.702 |
| 1005.3877 | 217.532 |
| 1006.0793 | 228.616 |
| 1006.771 | 252.667 |
| 1007.4627 | 239.645 |
| 1008.1544 | 237.17 |
| 1008.846 | 241.339 |
| 1009.5377 | 233.497 |
| 1010.2294 | 215.59 |
| 1010.921 | 230.909 |
| 1011.6127 | 233.368 |
| 1012.3043 | 231.333 |
| 1012.996 | 219.4 |
| 1013.6877 | 220.947 |
| 1014.3793 | 227.049 |
| 1015.071 | 211.524 |
| 1015.7626 | 193.635 |
| 1016.4543 | 189.918 |
| 1017.146 | 207.106 |
| 1017.8376 | 213.907 |
| 1018.5293 | 200.742 |
| 1019.2209 | 211.903 |
| 1019.9127 | 213.997 |
| 1020.6043 | 202.555 |
| 1021.296 | 212.772 |
| 1021.9876 | 207.851 |
| 1022.6793 | 215.008 |
| 1023.371 | 214.431 |
| 1024.0626 | 200.447 |
| 1024.7543 | 190.782 |
| 1025.4459 | 212.764 |
| 1026.1376 | 222.576 |
| 1026.8292 | 205.712 |
| 1027.5209 | 193.593 |
| 1028.2126 | 203.113 |
| 1028.9043 | 201.449 |
| 1029.5959 | 211.589 |
| 1030.2876 | 224.214 |
| 1030.9792 | 234.026 |
| 1031.6709 | 226.327 |
| 1032.3625 | 240.951 |
| 1033.0542 | 220.452 |
| 1033.7458 | 218.677 |
| 1034.4376 | 229.928 |
| 1035.1293 | 212.386 |
| 1035.8209 | 236.301 |
| 1036.5126 | 217.951 |
| 1037.2042 | 230.476 |
| 1037.8959 | 227.484 |
| 1038.5875 | 230.113 |
| 1039.2792 | 223 |
| 1039.9708 | 223.27 |
| 1040.6626 | 225.839 |
| 1041.3542 | 224.78 |
| 1042.0459 | 234.864 |
| 1042.7375 | 230.96 |
| 1043.4292 | 197.877 |
| 1044.1208 | 217.96 |
| 1044.8125 | 216.976 |
| 1045.5042 | 224.506 |
| 1046.1958 | 206.02 |
| 1046.8876 | 209.986 |
| 1047.5792 | 208.801 |
| 1048.2709 | 203.118 |
| 1048.9625 | 183.367 |
| 1049.6542 | 175.08 |
| 1050.3458 | 196.755 |
| 1051.0375 | 186.418 |
| 1051.7291 | 204.575 |
| 1052.4208 | 205.786 |
| 1053.1124 | 199.521 |
| 1053.8042 | 174.997 |
| 1054.4958 | 172.786 |
| 1055.1875 | 198.919 |
| 1055.8792 | 181.413 |
| 1056.5708 | 202.065 |
| 1057.2625 | 201.479 |
| 1057.9541 | 172.857 |
| 1058.6458 | 170.52 |
| 1059.3374 | 181.972 |
| 1060.0292 | 185.494 |
| 1060.7208 | 191.055 |
| 1061.4125 | 197.712 |
| 1062.1041 | 190.418 |
| 1062.7958 | 179.645 |
| 1063.4874 | 185.213 |
| 1064.1791 | 173.848 |
| 1064.8707 | 174.257 |
| 1065.5624 | 172.401 |
| 1066.2542 | 176.778 |
| 1066.9458 | 181.193 |
| 1067.6375 | 199.278 |
| 1068.3291 | 174.757 |
| 1069.0208 | 166.048 |
| 1069.7124 | 184.499 |
| 1070.4041 | 174.449 |
| 1071.0957 | 164.44 |
| 1071.7874 | 171.39 |
| 1072.4791 | 186.977 |
| 1073.1708 | 177.335 |
| 1073.8624 | 180.551 |
| 1074.5541 | 183.59 |
| 1075.2457 | 177.799 |
| 1075.9374 | 166.26 |
| 1076.629 | 179.895 |
| 1077.3207 | 170.427 |
| 1078.0123 | 184.871 |
| 1078.7041 | 180.851 |
| 1079.3958 | 174.751 |
| 1080.0874 | 164.537 |
| 1080.7791 | 163.02 |
| 1081.4707 | 173.343 |
| 1082.1624 | 174.116 |
| 1082.854 | 163.66 |
| 1083.5457 | 154.827 |
| 1084.2373 | 186.397 |
| 1084.929 | 179.109 |
| 1085.6207 | 182.176 |
| 1086.3124 | 185.365 |
| 1087.004 | 184.228 |
| 1087.6957 | 186.124 |
| 1088.3873 | 194.782 |
| 1089.079 | 179.634 |
| 1089.7706 | 179.051 |
| 1090.4623 | 184.819 |
| 1091.1539 | 188.666 |
| 1091.8457 | 197.529 |
| 1092.5374 | 181.943 |
| 1093.229 | 211.292 |
| 1093.9207 | 217.705 |
| 1094.6123 | 216.601 |
| 1095.304 | 210.186 |
| 1095.9956 | 218.277 |
| 1096.6873 | 218.061 |
| 1097.3789 | 220.79 |
| 1098.0707 | 239.751 |
| 1098.7623 | 232.638 |
| 1099.454 | 223.395 |
| 1100.1456 | 221.848 |
| 1100.8373 | 216.096 |
| 1101.5289 | 235.883 |
| 1102.2206 | 213.483 |
| 1102.9122 | 175.218 |
| 1103.6039 | 196.595 |
| 1104.2957 | 207.559 |
| 1104.9873 | 228.513 |
| 1105.679 | 234.767 |
| 1106.3706 | 245.636 |
| 1107.0623 | 245.624 |
| 1107.7539 | 250.588 |
| 1108.4456 | 255.205 |
| 1109.1372 | 257.477 |
| 1109.8289 | 268.371 |
| 1110.5205 | 284.647 |
| 1111.2123 | 280.03 |
| 1111.9039 | 301.629 |
| 1112.5956 | 296.356 |
| 1113.2872 | 297.144 |
| 1113.9789 | 307.166 |
| 1114.6705 | 282.372 |
| 1115.3622 | 275.541 |
| 1116.0538 | 278.324 |
| 1116.7455 | 270.261 |
| 1117.4373 | 272.485 |
| 1118.1289 | 276.149 |
| 1118.8206 | 268.069 |
| 1119.5122 | 263.564 |
| 1120.2039 | 257.209 |
| 1120.8955 | 245.457 |
| 1121.5872 | 220.053 |
| 1122.2788 | 225.606 |
| 1122.9705 | 237.068 |
| 1123.6622 | 199.151 |
| 1124.3539 | 224.442 |
| 1125.0455 | 223.423 |
| 1125.7372 | 205.886 |
| 1126.4288 | 210.506 |
| 1127.1205 | 217.994 |
| 1127.8121 | 212.93 |
| 1128.5038 | 200.455 |
| 1129.1954 | 205.83 |
| 1129.8872 | 200.765 |
| 1130.5789 | 199.106 |
| 1131.2705 | 191.597 |
| 1131.9622 | 208.24 |
| 1132.6538 | 193.517 |
| 1133.3455 | 204.001 |
| 1134.0371 | 192.901 |
| 1134.7288 | 206.831 |
| 1135.4204 | 211.575 |
| 1136.1122 | 186.95 |
| 1136.8038 | 193.492 |
| 1137.4955 | 172.418 |
| 1138.1871 | 213.911 |
| 1138.8788 | 223.688 |
| 1139.5704 | 199.842 |
| 1140.2621 | 204.755 |
| 1140.9537 | 199.921 |
| 1141.6454 | 209.313 |
| 1142.337 | 230.207 |
| 1143.0288 | 214.141 |
| 1143.7205 | 221.425 |
| 1144.4121 | 211.495 |
| 1145.1038 | 217.698 |
| 1145.7954 | 199.753 |
| 1146.4871 | 188.649 |
| 1147.1787 | 217.389 |
| 1147.8704 | 218.894 |
| 1148.562 | 203.386 |
| 1149.2538 | 203.801 |
| 1149.9454 | 232.507 |
| 1150.6371 | 221.601 |
| 1151.3287 | 235.322 |
| 1152.0204 | 235.621 |
| 1152.712 | 245.904 |
| 1153.4037 | 234.185 |
| 1154.0953 | 218.563 |
| 1154.787 | 225.128 |
| 1155.4788 | 257.725 |
| 1156.1704 | 239.678 |
| 1156.8621 | 243.547 |
| 1157.5537 | 242.65 |
| 1158.2454 | 250.697 |
| 1158.937 | 247.912 |
| 1159.6287 | 238.628 |
| 1160.3203 | 249.103 |
| 1161.012 | 250.439 |
| 1161.7037 | 238.56 |
| 1162.3954 | 246.309 |
| 1163.087 | 248.997 |
| 1163.7787 | 254.902 |
| 1164.4703 | 245.767 |
| 1165.162 | 214.224 |
| 1165.8536 | 228.627 |
| 1166.5453 | 232.072 |
| 1167.2369 | 217.05 |
| 1167.9286 | 226.112 |
| 1168.6204 | 245.709 |
| 1169.312 | 242.799 |
| 1170.0037 | 239.436 |
| 1170.6953 | 217.962 |
| 1171.387 | 228.664 |
| 1172.0786 | 238.369 |
| 1172.7703 | 237.208 |
| 1173.4619 | 243.79 |
| 1174.1536 | 237.852 |
| 1174.8453 | 232.822 |
| 1175.537 | 221.336 |
| 1176.2286 | 215.274 |
| 1176.9203 | 230.859 |
| 1177.6119 | 237.567 |
| 1178.3036 | 241.894 |
| 1178.9952 | 246.71 |
| 1179.6869 | 250.716 |
| 1180.3785 | 233.236 |
| 1181.0703 | 240.007 |
| 1181.762 | 238.525 |
| 1182.4536 | 245.622 |
| 1183.1453 | 242.885 |
| 1183.8369 | 257.637 |
| 1184.5286 | 233.744 |
| 1185.2202 | 244.63 |
| 1185.9119 | 263.837 |
| 1186.6035 | 257.67 |
| 1187.2953 | 269.893 |
| 1187.9869 | 231.509 |
| 1188.6786 | 244.132 |
| 1189.3702 | 261.603 |
| 1190.0619 | 259.014 |
| 1190.7535 | 242.084 |
| 1191.4452 | 263.247 |
| 1192.1368 | 275.289 |
| 1192.8285 | 247.701 |
| 1193.5203 | 248.044 |
| 1194.2119 | 289.335 |
| 1194.9036 | 279.033 |
| 1195.5952 | 296.549 |
| 1196.2869 | 269.285 |
| 1196.9785 | 258.721 |
| 1197.6702 | 254.812 |
| 1198.3618 | 279.642 |
| 1199.0535 | 290.113 |
| 1199.7451 | 269.422 |
| 1200.4369 | 288.841 |
| 1201.1285 | 289.55 |
| 1201.8202 | 274.622 |
| 1202.5118 | 292.327 |
| 1203.2035 | 306.155 |
| 1203.8951 | 302.781 |
| 1204.5868 | 291.911 |
| 1205.2784 | 290.475 |
| 1205.9701 | 282.927 |
| 1206.6619 | 277.919 |
| 1207.3535 | 288.927 |
| 1208.0452 | 304.076 |
| 1208.7368 | 295.043 |
| 1209.4285 | 293.131 |
| 1210.1201 | 299.101 |
| 1210.8118 | 297.304 |
| 1211.5034 | 305.767 |
| 1212.1951 | 296.426 |
| 1212.8868 | 279.305 |
| 1213.5785 | 286.767 |
| 1214.2701 | 280.871 |
| 1214.9618 | 264.17 |
| 1215.6534 | 298.742 |
| 1216.3451 | 274.048 |
| 1217.0367 | 292.793 |
| 1217.7284 | 281.867 |
| 1218.42 | 296.197 |
| 1219.1118 | 279.11 |
| 1219.8035 | 269.628 |
| 1220.4951 | 281.062 |
| 1221.1868 | 307.906 |
| 1221.8784 | 304.815 |
| 1222.5701 | 289.704 |
| 1223.2617 | 284.701 |
| 1223.9534 | 279.819 |
| 1224.645 | 302.464 |
| 1225.3368 | 273.558 |
| 1226.0284 | 244.995 |
| 1226.7201 | 266.003 |
| 1227.4117 | 279.635 |
| 1228.1034 | 274.543 |
| 1228.795 | 287.786 |
| 1229.4867 | 288.334 |
| 1230.1783 | 284.448 |
| 1230.87 | 273.237 |
| 1231.5616 | 274.727 |
| 1232.2534 | 274.307 |
| 1232.9451 | 274.343 |
| 1233.6367 | 274.257 |
| 1234.3284 | 264.938 |
| 1235.02 | 248.891 |
| 1235.7117 | 259.319 |
| 1236.4033 | 272.264 |
| 1237.095 | 273.735 |
| 1237.7866 | 276.381 |
| 1238.4784 | 267.491 |
| 1239.17 | 275.201 |
| 1239.8617 | 271.85 |
| 1240.5533 | 284.743 |
| 1241.245 | 289.036 |
| 1241.9366 | 266.301 |
| 1242.6283 | 280.531 |
| 1243.3199 | 260.973 |
| 1244.0116 | 269.674 |
| 1244.7034 | 270.228 |
| 1245.395 | 267.057 |
| 1246.0867 | 253.567 |
| 1246.7783 | 264.682 |
| 1247.47 | 255.881 |
| 1248.1616 | 279.521 |
| 1248.8533 | 271.23 |
| 1249.5449 | 261.135 |
| 1250.2366 | 270.849 |
| 1250.9283 | 270.202 |
| 1251.62 | 304.121 |
| 1252.3116 | 272.841 |
| 1253.0033 | 263.563 |
| 1253.6949 | 258.176 |
| 1254.3866 | 259.378 |
| 1255.0782 | 258.428 |
| 1255.7699 | 267 |
| 1256.4615 | 269.336 |
| 1257.1532 | 277.669 |
| 1257.845 | 275.49 |
| 1258.5366 | 284.256 |
| 1259.2283 | 300.775 |
| 1259.9199 | 296.626 |
| 1260.6116 | 283.465 |
| 1261.3032 | 288.502 |
| 1261.9949 | 284.746 |
| 1262.6865 | 289.421 |
| 1263.3782 | 248.892 |
| 1264.0699 | 238.682 |
| 1264.7616 | 286.018 |
| 1265.4532 | 292.825 |
| 1266.1449 | 271.328 |
| 1266.8365 | 302.698 |
| 1267.5282 | 298.431 |
| 1268.2198 | 278.751 |
| 1268.9115 | 313.637 |
| 1269.6031 | 319.822 |
| 1270.2949 | 321.702 |
| 1270.9866 | 329.405 |
| 1271.6782 | 307.385 |
| 1272.3699 | 305.832 |
| 1273.0615 | 312.587 |
| 1273.7532 | 318.36 |
| 1274.4448 | 320.77 |
| 1275.1365 | 330.169 |
| 1275.8281 | 321.279 |
| 1276.5199 | 317.633 |
| 1277.2115 | 334.584 |
| 1277.9032 | 337.517 |
| 1278.5948 | 337.505 |
| 1279.2865 | 339.283 |
| 1279.9781 | 342.08 |
| 1280.6698 | 324.869 |
| 1281.3615 | 331.25 |
| 1282.0531 | 322.856 |
| 1282.7449 | 324.447 |
| 1283.4365 | 317.051 |
| 1284.1282 | 332.522 |
| 1284.8198 | 338 |
| 1285.5115 | 317.278 |
| 1286.2031 | 311.299 |
| 1286.8948 | 317.516 |
| 1287.5864 | 330.589 |
| 1288.2781 | 342.793 |
| 1288.9697 | 342.291 |
| 1289.6615 | 310.166 |
| 1290.3531 | 314.151 |
| 1291.0448 | 328.862 |
| 1291.7365 | 320.594 |
| 1292.4281 | 308.971 |
| 1293.1198 | 317.105 |
| 1293.8114 | 326.864 |
| 1294.5031 | 340.723 |
| 1295.1947 | 342.017 |
| 1295.8865 | 351.24 |
| 1296.5781 | 340.34 |
| 1297.2698 | 318.414 |
| 1297.9614 | 324.277 |
| 1298.6531 | 319.345 |
| 1299.3447 | 314.716 |
| 1300.0364 | 323.732 |
| 1300.728 | 317.575 |
| 1301.4197 | 312.44 |
| 1302.1115 | 307.856 |
| 1302.8031 | 300.097 |
| 1303.4948 | 330.524 |
| 1304.1864 | 320.318 |
| 1304.8781 | 334.144 |
| 1305.5697 | 320.985 |
| 1306.2614 | 304.743 |
| 1306.953 | 305.892 |
| 1307.6447 | 327.214 |
| 1308.3364 | 312.101 |
| 1309.0281 | 295.258 |
| 1309.7197 | 280.935 |
| 1310.4114 | 286.044 |
| 1311.103 | 305.185 |
| 1311.7947 | 294.429 |
| 1312.4863 | 286.483 |
| 1313.178 | 295.038 |
| 1313.8696 | 287.696 |
| 1314.5613 | 274.068 |
| 1315.2531 | 271.17 |
| 1315.9447 | 304.045 |
| 1316.6364 | 287.53 |
| 1317.328 | 285.656 |
| 1318.0197 | 270.136 |
| 1318.7113 | 285.016 |
| 1319.403 | 269.165 |
| 1320.0946 | 286.759 |
| 1320.7863 | 292.792 |
| 1321.478 | 289.029 |
| 1322.1697 | 262.719 |
| 1322.8613 | 261.887 |
| 1323.553 | 271.686 |
| 1324.2446 | 270.273 |
| 1324.9363 | 270.287 |
| 1325.6279 | 278.559 |
| 1326.3196 | 260.592 |
| 1327.0112 | 253.968 |
| 1327.703 | 271.325 |
| 1328.3947 | 277.882 |
| 1329.0863 | 271.585 |
| 1329.778 | 253.54 |
| 1330.4696 | 263.852 |
| 1331.1613 | 264.71 |
| 1331.8529 | 276.022 |
| 1332.5446 | 262.312 |
| 1333.2362 | 240.629 |
| 1333.928 | 271.261 |
| 1334.6196 | 245.953 |
| 1335.3113 | 262.793 |
| 1336.0029 | 247.649 |
| 1336.6946 | 246.571 |
| 1337.3862 | 228.845 |
| 1338.0779 | 256.583 |
| 1338.7695 | 242.147 |
| 1339.4612 | 238.202 |
| 1340.153 | 275.057 |
| 1340.8446 | 257.685 |
| 1341.5363 | 253.144 |
| 1342.2279 | 251.183 |
| 1342.9196 | 225.162 |
| 1343.6112 | 232.887 |
| 1344.3029 | 234.43 |
| 1344.9945 | 232.531 |
| 1345.6862 | 232.153 |
| 1346.3778 | 232.091 |
| 1347.0696 | 236.257 |
| 1347.7612 | 237.161 |
| 1348.4529 | 237 |
| 1349.1445 | 226.257 |
| 1349.8362 | 195.663 |
| 1350.5278 | 236.841 |
| 1351.2195 | 229.859 |
| 1351.9111 | 245.119 |
| 1352.6028 | 227.253 |
| 1353.2946 | 219.18 |
| 1353.9862 | 209.541 |
| 1354.6779 | 229.343 |
| 1355.3695 | 229.535 |
| 1356.0612 | 220.069 |
| 1356.7528 | 226.361 |
| 1357.4445 | 216.175 |
| 1358.1361 | 212.195 |
| 1358.8278 | 213.177 |
| 1359.5195 | 226.141 |
| 1360.2112 | 222.257 |
| 1360.9028 | 191.48 |
| 1361.5945 | 200.306 |
| 1362.2861 | 207.303 |
| 1362.9778 | 210.784 |
| 1363.6694 | 185.147 |
| 1364.3611 | 221.488 |
| 1365.0527 | 207.118 |
| 1365.7445 | 193.28 |
| 1366.4362 | 205.821 |
| 1367.1278 | 199.474 |
| 1367.8195 | 202.861 |
| 1368.5111 | 195.783 |
| 1369.2028 | 197.855 |
| 1369.8944 | 213 |
| 1370.5861 | 211.833 |
| 1371.2777 | 209.04 |
| 1371.9694 | 202.193 |
| 1372.6611 | 193.32 |
| 1373.3528 | 194.681 |
| 1374.0444 | 208.84 |
| 1374.7361 | 191.22 |
| 1375.4277 | 178.647 |
| 1376.1194 | 190.601 |
| 1376.811 | 169.973 |
| 1377.5027 | 179.38 |
| 1378.1943 | 202.372 |
| 1378.8861 | 182.947 |
| 1379.5778 | 197.707 |
| 1380.2694 | 206.242 |
| 1380.9611 | 206.257 |
| 1381.6527 | 199.116 |
| 1382.3444 | 182.463 |
| 1383.036 | 179.078 |
| 1383.7277 | 185.508 |
| 1384.4193 | 202.672 |
| 1385.1111 | 202.8 |
| 1385.8027 | 205.445 |
| 1386.4944 | 196.266 |
| 1387.186 | 216.76 |
| 1387.8777 | 200.186 |
| 1388.5693 | 187.013 |
| 1389.261 | 199.941 |
| 1389.9526 | 212.778 |
| 1390.6443 | 197.963 |
| 1391.3361 | 207.069 |
| 1392.0277 | 225.572 |
| 1392.7194 | 210.966 |
| 1393.411 | 219.586 |
| 1394.1027 | 213.207 |
| 1394.7943 | 196.227 |
| 1395.486 | 210.035 |
| 1396.1776 | 230.504 |
| 1396.8693 | 221.578 |
| 1397.561 | 218.549 |
| 1398.2527 | 207.965 |
| 1398.9443 | 184.501 |
| 1399.636 | 210.886 |
| 1400.3276 | 219.666 |
| 1401.0193 | 203.464 |
| 1401.7109 | 206.596 |
| 1402.4026 | 208.914 |
| 1403.0942 | 193.024 |
| 1403.7859 | 205.514 |
| 1404.4777 | 205.839 |
| 1405.1693 | 214.307 |
| 1405.861 | 217.975 |
| 1406.5526 | 221.05 |
| 1407.2443 | 207.381 |
| 1407.9359 | 206.978 |
| 1408.6276 | 210.553 |
| 1409.3192 | 211.373 |
| 1410.0109 | 217.376 |
| 1410.7026 | 205.904 |
| 1411.3943 | 204.729 |
| 1412.0859 | 209.333 |
| 1412.7776 | 218.002 |
| 1413.4692 | 216.083 |
| 1414.1609 | 224.647 |
| 1414.8525 | 229.183 |
| 1415.5442 | 237.175 |
| 1416.2358 | 226.115 |
| 1416.9276 | 217.438 |
| 1417.6193 | 219.24 |
| 1418.3109 | 222.577 |
| 1419.0026 | 232.372 |
| 1419.6942 | 227.806 |
| 1420.3859 | 231.634 |
| 1421.0775 | 228.907 |
| 1421.7692 | 236.898 |
| 1422.4608 | 221.917 |
| 1423.1526 | 204.608 |
| 1423.8442 | 216.627 |
| 1424.5359 | 226.857 |
| 1425.2275 | 217.096 |
| 1425.9192 | 233.552 |
| 1426.6108 | 239.77 |
| 1427.3025 | 246.835 |
| 1427.9941 | 248.539 |
| 1428.6858 | 240.278 |
| 1429.3776 | 246.353 |
| 1430.0692 | 243.221 |
| 1430.7609 | 245.544 |
| 1431.4525 | 248.07 |
| 1432.1442 | 254.359 |
| 1432.8358 | 272.814 |
| 1433.5275 | 254.597 |
| 1434.2191 | 255.693 |
| 1434.9108 | 284.109 |
| 1435.6024 | 285.085 |
| 1436.2942 | 288.771 |
| 1436.9858 | 268.009 |
| 1437.6775 | 283.222 |
| 1438.3691 | 297.405 |
| 1439.0608 | 298.655 |
| 1439.7524 | 295.987 |
| 1440.4441 | 311.508 |
| 1441.1357 | 302.914 |
| 1441.8274 | 314.098 |
| 1442.5192 | 306.614 |
| 1443.2108 | 321.771 |
| 1443.9025 | 315.65 |
| 1444.5941 | 327.488 |
| 1445.2858 | 322.689 |
| 1445.9774 | 325.629 |
| 1446.6691 | 321.87 |
| 1447.3607 | 307.863 |
| 1448.0524 | 318.243 |
| 1448.7441 | 334.046 |
| 1449.4358 | 321.662 |
| 1450.1274 | 303.508 |
| 1450.8191 | 307.406 |
| 1451.5107 | 328.802 |
| 1452.2024 | 317.01 |
| 1452.894 | 306.294 |
| 1453.5857 | 307.529 |
| 1454.2773 | 317.172 |
| 1454.9691 | 324.147 |
| 1455.6608 | 330.025 |
| 1456.3524 | 324.965 |
| 1457.0441 | 313.416 |
| 1457.7357 | 305.826 |
| 1458.4274 | 301.577 |
| 1459.119 | 300.519 |
| 1459.8107 | 282.041 |
| 1460.5023 | 275.94 |
| 1461.194 | 286.708 |
| 1461.8857 | 276.059 |
| 1462.5774 | 269.858 |
| 1463.269 | 260.317 |
| 1463.9607 | 248.373 |
| 1464.6523 | 240.93 |
| 1465.344 | 230.433 |
| 1466.0356 | 243.712 |
| 1466.7273 | 250.2 |
| 1467.4189 | 233.477 |
| 1468.1107 | 232.42 |
| 1468.8024 | 226.779 |
| 1469.494 | 222.189 |
| 1470.1857 | 239.42 |
| 1470.8773 | 231.874 |
| 1471.569 | 231.568 |
| 1472.2606 | 210.276 |
| 1472.9523 | 214.973 |
| 1473.6439 | 223.387 |
| 1474.3357 | 207.117 |
| 1475.0273 | 207.15 |
| 1475.719 | 191.214 |
| 1476.4106 | 194.536 |
| 1477.1023 | 199.896 |
| 1477.7939 | 198.261 |
| 1478.4856 | 195.843 |
| 1479.1772 | 185.548 |
| 1479.8689 | 205.151 |
| 1480.5607 | 190.444 |
| 1481.2523 | 188.17 |
| 1481.944 | 192.425 |
| 1482.6356 | 171.807 |
| 1483.3273 | 181.938 |
| 1484.0189 | 191.21 |
| 1484.7106 | 188.187 |
| 1485.4022 | 194.27 |
| 1486.0939 | 192.735 |
| 1486.7856 | 199.212 |
| 1487.4773 | 209.667 |
| 1488.1689 | 182.573 |
| 1488.8606 | 176.199 |
| 1489.5522 | 177.548 |
| 1490.2439 | 177.161 |
| 1490.9355 | 179.612 |
| 1491.6272 | 186.289 |
| 1492.3188 | 197.298 |
| 1493.0105 | 163.086 |
| 1493.7023 | 178.895 |
| 1494.3939 | 171.957 |
| 1495.0856 | 171.617 |
| 1495.7772 | 187.439 |
| 1496.4689 | 194.038 |
| 1497.1605 | 184.963 |
| 1497.8522 | 175.198 |
| 1498.5438 | 171.779 |
| 1499.2355 | 168.894 |
| 1499.9272 | 171.052 |
| 1500.6189 | 175.563 |
| 1501.3105 | 178.676 |
| 1502.0022 | 195.3 |
| 1502.6938 | 175.698 |
| 1503.3855 | 172.304 |
| 1504.0771 | 193.258 |
| 1504.7688 | 177.208 |
| 1505.4604 | 190.119 |
| 1506.1522 | 188.576 |
| 1506.8439 | 175.999 |
| 1507.5355 | 174.841 |
| 1508.2272 | 183.921 |
| 1508.9188 | 180.624 |
| 1509.6105 | 185.11 |
| 1510.3021 | 188.337 |
| 1510.9938 | 186.519 |
| 1511.6854 | 180.787 |
| 1512.3772 | 182.328 |
| 1513.0688 | 208.996 |
| 1513.7605 | 183.871 |
| 1514.4521 | 192.658 |
| 1515.1438 | 160.423 |
| 1515.8354 | 193.292 |
| 1516.5271 | 195.113 |
| 1517.2188 | 201.053 |
| 1517.9104 | 193.815 |
| 1518.6021 | 184.607 |
| 1519.2938 | 187.266 |
| 1519.9855 | 171.832 |
| 1520.6771 | 178.584 |
| 1521.3688 | 177.254 |
| 1522.0604 | 187.508 |
| 1522.7521 | 175.818 |
| 1523.4437 | 174.689 |
| 1524.1354 | 179.266 |
| 1524.827 | 177.324 |
| 1525.5188 | 172.082 |
| 1526.2104 | 187.771 |
| 1526.9021 | 185.543 |
| 1527.5938 | 176.897 |
| 1528.2854 | 175.258 |
| 1528.9771 | 177.171 |
| 1529.6687 | 178.871 |
| 1530.3604 | 188.88 |
| 1531.052 | 184.056 |
| 1531.7438 | 173.618 |
| 1532.4354 | 186.841 |
| 1533.1271 | 185.606 |
| 1533.8187 | 166.833 |
| 1534.5104 | 182.79 |
| 1535.202 | 178.856 |
| 1535.8937 | 164.367 |
| 1536.5853 | 165.637 |
| 1537.277 | 165.637 |
| 1537.9688 | 187.625 |
| 1538.6604 | 191.973 |
| 1539.3521 | 181.379 |
| 1540.0437 | 180.641 |
| 1540.7354 | 189.248 |
| 1541.427 | 167.12 |
| 1542.1187 | 166.607 |
| 1542.8103 | 176.337 |
| 1543.502 | 183.674 |
| 1544.1937 | 186.441 |
| 1544.8854 | 184.909 |
| 1545.577 | 182.194 |
| 1546.2687 | 171.516 |
| 1546.9603 | 209.878 |
| 1547.652 | 187.721 |
| 1548.3436 | 184.685 |
| 1549.0353 | 199.484 |
| 1549.7269 | 167.567 |
| 1550.4186 | 181.254 |
| 1551.1104 | 183.805 |
| 1551.802 | 184.277 |
| 1552.4937 | 169.555 |
| 1553.1853 | 179.767 |
| 1553.877 | 198.905 |
| 1554.5686 | 180.835 |
| 1555.2603 | 181.095 |
| 1555.9519 | 165.704 |
| 1556.6436 | 182.027 |
| 1557.3353 | 175.332 |
| 1558.027 | 166.803 |
| 1558.7186 | 175.242 |
| 1559.4103 | 177.937 |
| 1560.1019 | 179.729 |
| 1560.7936 | 183.637 |
| 1561.4852 | 176.361 |
| 1562.1769 | 179.318 |
| 1562.8685 | 186.777 |
| 1563.5603 | 192.314 |
| 1564.252 | 182.706 |
| 1564.9436 | 185.266 |
| 1565.6353 | 181.758 |
| 1566.3269 | 173.157 |
| 1567.0186 | 171.503 |
| 1567.7102 | 177.465 |
| 1568.4019 | 169.983 |
| 1569.0935 | 171.789 |
| 1569.7853 | 206.12 |
| 1570.4769 | 174.752 |
| 1571.1686 | 156.54 |
| 1571.8602 | 187.539 |
| 1572.5519 | 174.17 |
| 1573.2435 | 172.247 |
| 1573.9352 | 162.4 |
| 1574.6268 | 155.998 |
| 1575.3185 | 172.329 |
| 1576.0103 | 169.5 |
| 1576.7019 | 170.712 |
| 1577.3936 | 158.056 |
| 1578.0852 | 169.388 |
| 1578.7769 | 158.777 |
| 1579.4685 | 169.981 |
| 1580.1602 | 174.099 |
| 1580.8518 | 168.129 |
| 1581.5435 | 163.217 |
| 1582.2351 | 153.421 |
| 1582.9269 | 172.116 |
| 1583.6185 | 170.719 |
| 1584.3102 | 165.967 |
| 1585.0018 | 184.102 |
| 1585.6935 | 161.844 |
| 1586.3851 | 183.209 |
| 1587.0768 | 170.852 |
| 1587.7684 | 174.02 |
| 1588.4601 | 168.829 |
| 1589.1519 | 184.616 |
| 1589.8435 | 169.752 |
| 1590.5352 | 164.56 |
| 1591.2268 | 169 |
| 1591.9185 | 175.316 |
| 1592.6101 | 170.646 |
| 1593.3018 | 190.093 |
| 1593.9934 | 184.748 |
| 1594.6851 | 158.468 |
| 1595.3768 | 165.371 |
| 1596.0685 | 170.984 |
| 1596.7601 | 159.531 |
| 1597.4518 | 150.643 |
| 1598.1434 | 155.638 |
| 1598.8351 | 152.757 |
| 1599.5267 | 161.28 |
| 1600.2184 | 184.067 |
| 1600.91 | 150.961 |
| 1601.6018 | 140.841 |
| 1602.2935 | 161.468 |
| 1602.9851 | 161.329 |
| 1603.6768 | 156.734 |
| 1604.3684 | 149.873 |
| 1605.0601 | 136.692 |
| 1605.7517 | 144.61 |
| 1606.4434 | 166.778 |
| 1607.135 | 171.432 |
| 1607.8267 | 143.688 |
| 1608.5184 | 148.227 |
| 1609.2101 | 159.388 |
| 1609.9017 | 152.371 |
| 1610.5934 | 153.84 |
| 1611.285 | 165.65 |
| 1611.9767 | 169.732 |
| 1612.6683 | 158.754 |
| 1613.36 | 142.58 |
| 1614.0516 | 169.202 |
| 1614.7434 | 159.517 |
| 1615.4351 | 160.055 |
| 1616.1267 | 136.058 |
| 1616.8184 | 150.086 |
| 1617.51 | 148.679 |
| 1618.2017 | 153.847 |
| 1618.8933 | 164.356 |
| 1619.585 | 155.791 |
| 1620.2766 | 148.313 |
| 1620.9684 | 131.95 |
| 1621.66 | 139.661 |
| 1622.3517 | 150.174 |
| 1623.0433 | 150.205 |
| 1623.735 | 148.582 |
| 1624.4266 | 146.153 |
| 1625.1183 | 141.75 |
| 1625.8099 | 144.17 |
| 1626.5016 | 148.43 |
| 1627.1934 | 157.759 |
| 1627.885 | 146.646 |
| 1628.5767 | 136.072 |
| 1629.2683 | 144.339 |
| 1629.96 | 137.024 |
| 1630.6516 | 135.826 |
| 1631.3433 | 146.113 |
| 1632.0349 | 128.148 |
| 1632.7266 | 152.685 |
| 1633.4183 | 141.504 |
| 1634.11 | 140.819 |
| 1634.8016 | 130.822 |
| 1635.4933 | 152.625 |
| 1636.1849 | 142.024 |
| 1636.8766 | 140.871 |
| 1637.5682 | 140.366 |
| 1638.2599 | 134.056 |
| 1638.9515 | 138.666 |
| 1639.6432 | 152.85 |
| 1640.335 | 158.504 |
| 1641.0266 | 138.011 |
| 1641.7183 | 146.428 |
| 1642.4099 | 121.334 |
| 1643.1016 | 117.834 |
| 1643.7932 | 129.369 |
| 1644.4849 | 144.603 |
| 1645.1765 | 127.706 |
| 1645.8682 | 138.917 |
| 1646.5599 | 143.589 |
| 1647.2516 | 117.583 |
| 1647.9432 | 132.843 |
| 1648.6349 | 122.205 |
| 1649.3265 | 130.227 |
| 1650.0182 | 136.378 |
| 1650.7098 | 140.71 |
| 1651.4015 | 134.663 |
| 1652.0931 | 131.056 |
| 1652.7849 | 136.928 |
| 1653.4766 | 126.764 |
| 1654.1682 | 141.228 |
| 1654.8599 | 131.627 |
| 1655.5515 | 139.7 |
| 1656.2432 | 150.782 |
| 1656.9348 | 145.575 |
| 1657.6265 | 137.881 |
| 1658.3181 | 124.595 |
| 1659.0099 | 134.845 |
| 1659.7015 | 124.048 |
| 1660.3932 | 117.103 |
| 1661.0848 | 124.484 |
| 1661.7765 | 129.319 |
| 1662.4681 | 119.355 |
| 1663.1598 | 131.592 |
| 1663.8514 | 141.59 |
| 1664.5431 | 124.818 |
| 1665.2347 | 126.962 |
| 1665.9265 | 119.031 |
| 1666.6182 | 111.42 |
| 1667.3098 | 115.377 |
| 1668.0015 | 141.965 |
| 1668.6931 | 144.552 |
| 1669.3848 | 129.007 |
| 1670.0764 | 123.283 |
| 1670.7681 | 127.122 |
| 1671.4597 | 126.844 |
| 1672.1515 | 104.865 |
| 1672.8431 | 127.944 |
| 1673.5348 | 123.946 |
| 1674.2264 | 126.298 |
| 1674.9181 | 122.043 |
| 1675.6097 | 109.38 |
| 1676.3014 | 130.331 |
| 1676.993 | 109.57 |
| 1677.6847 | 136.62 |
| 1678.3765 | 120.93 |
| 1679.0681 | 120.055 |
| 1679.7598 | 123.781 |
| 1680.4514 | 121.576 |
| 1681.1431 | 124.04 |
| 1681.8347 | 118.168 |
| 1682.5264 | 133.447 |
| 1683.218 | 133.743 |
| 1683.9097 | 132.984 |
| 1684.6014 | 110.974 |
| 1685.2931 | 133.617 |
| 1685.9847 | 124.276 |
| 1686.6764 | 122.79 |
| 1687.368 | 117.069 |
| 1688.0597 | 113.967 |
| 1688.7513 | 125.048 |
| 1689.443 | 116.109 |
| 1690.1346 | 119.028 |
| 1690.8264 | 121.934 |
| 1691.5181 | 118.451 |
| 1692.2097 | 128.039 |
| 1692.9014 | 123.621 |
| 1693.593 | 116.53 |
| 1694.2847 | 131.883 |
| 1694.9763 | 114.063 |
| 1695.668 | 123.888 |
| 1696.3596 | 129.212 |
| 1697.0513 | 123.707 |
| 1697.743 | 138.27 |
| 1698.4347 | 125.624 |
| 1699.1263 | 121.535 |
| 1699.818 | 124.271 |
| 1700.5096 | 125.218 |
| 1701.2013 | 124.576 |
| 1701.8929 | 118.038 |
| 1702.5846 | 120.5 |
| 1703.2762 | 127.222 |
| 1703.968 | 130.239 |
| 1704.6597 | 121.944 |
| 1705.3513 | 118.501 |
| 1706.043 | 122.986 |
| 1706.7346 | 128.887 |
| 1707.4263 | 116.159 |
| 1708.1179 | 126.665 |
| 1708.8096 | 133.532 |
| 1709.5012 | 130.047 |
| 1710.193 | 120.953 |
| 1710.8846 | 125.876 |
| 1711.5763 | 130.1 |
| 1712.2679 | 100.629 |
| 1712.9596 | 114.271 |
| 1713.6512 | 127.848 |
| 1714.3429 | 110.794 |
| 1715.0345 | 123.187 |
| 1715.7262 | 135.724 |
| 1716.418 | 136.809 |
| 1717.1096 | 130.499 |
| 1717.8013 | 126.229 |
| 1718.4929 | 109.525 |
| 1719.1846 | 129.755 |
| 1719.8762 | 119.162 |
| 1720.5679 | 141.362 |
| 1721.2595 | 139.396 |
| 1721.9512 | 136.571 |
| 1722.6428 | 131.537 |
| 1723.3346 | 130.521 |
| 1724.0262 | 129.694 |
| 1724.7179 | 116.887 |
| 1725.4095 | 141.568 |
| 1726.1012 | 123.863 |
| 1726.7928 | 130.491 |
| 1727.4845 | 116.277 |
| 1728.1761 | 131.648 |
| 1728.8678 | 138.756 |
| 1729.5596 | 139 |
| 1730.2512 | 114.809 |
| 1730.9429 | 134.103 |
| 1731.6345 | 142.747 |
| 1732.3262 | 118.655 |
| 1733.0178 | 125.602 |
| 1733.7095 | 141.36 |
| 1734.4011 | 128.975 |
| 1735.0928 | 143.93 |
| 1735.7845 | 134.431 |
| 1736.4762 | 144.581 |
| 1737.1678 | 128.073 |
| 1737.8595 | 123.99 |
| 1738.5511 | 125.668 |
| 1739.2428 | 133.378 |
| 1739.9344 | 117.843 |
| 1740.6261 | 141.63 |
| 1741.3177 | 120.03 |
| 1742.0095 | 118.26 |
| 1742.7012 | 124.948 |
| 1743.3928 | 129.946 |
| 1744.0845 | 133.893 |
| 1744.7761 | 116.629 |
| 1745.4678 | 125.343 |
| 1746.1594 | 111.065 |
| 1746.8511 | 117.486 |
| 1747.5427 | 135.485 |
| 1748.2345 | 125.452 |
| 1748.9261 | 120.981 |
| 1749.6178 | 130.272 |
| 1750.3094 | 119.023 |
| 1751.0011 | 142.772 |
| 1751.6927 | 98.66 |
| 1752.3844 | 127.199 |
| 1753.076 | 106.146 |
| 1753.7677 | 127.496 |
| 1754.4594 | 115.41 |
| 1755.1511 | 111.724 |
| 1755.8428 | 117.551 |
| 1756.5344 | 102.174 |
| 1757.2261 | 101.417 |
| 1757.9177 | 109.965 |
| 1758.6094 | 110.636 |
| 1759.301 | 105.287 |
| 1759.9927 | 96.299 |
| 1760.6843 | 91.65 |
| 1761.3761 | 100.003 |
| 1762.0677 | 101.322 |
| 1762.7594 | 103.614 |
| 1763.451 | 90.61 |
| 1764.1427 | 95.367 |
| 1764.8344 | 94.638 |
| 1765.526 | 89.378 |
| 1766.2177 | 85.422 |
| 1766.9093 | 83.645 |
| 1767.6011 | 94.17 |
| 1768.2927 | 91 |
| 1768.9844 | 89.802 |
| 1769.676 | 89.409 |
| 1770.3677 | 94.897 |
| 1771.0593 | 102.347 |
| 1771.751 | 91.737 |
| 1772.4426 | 76.182 |
| 1773.1343 | 99.79 |
| 1773.826 | 90.715 |
| 1774.5177 | 81.217 |
| 1775.2094 | 86.486 |
| 1775.901 | 73.624 |
| 1776.5927 | 78.652 |
| 1777.2843 | 66.737 |
| 1777.976 | 85.546 |
| 1778.6676 | 77.338 |
| 1779.3593 | 83.852 |
| 1780.051 | 77.76 |
| 1780.7427 | 91.346 |
| 1781.4343 | 91.928 |
| 1782.126 | 88.64 |
| 1782.8176 | 74.243 |
| 1783.5093 | 89.286 |
| 1784.2009 | 68.85 |
| 1784.8926 | 81.355 |
| 1785.5842 | 80.564 |
| 1786.2759 | 87.575 |
| 1786.9677 | 67.678 |
| 1787.6593 | 71.446 |
| 1788.351 | 76.253 |
| 1789.0426 | 71 |
| 1789.7343 | 81.389 |
| 1790.4259 | 79.493 |
| 1791.1176 | 76.947 |
| 1791.8092 | 97.602 |
| 1792.5009 | 72.364 |
| 1793.1926 | 78.463 |
| 1793.8843 | 84.163 |
| 1794.5759 | 83.601 |
| 1795.2676 | 72.578 |
| 1795.9592 | 64.203 |
| 1796.6509 | 77.729 |
| 1797.3425 | 59.066 |
| 1798.0342 | 79.97 |
| 1798.7258 | 71.001 |
| 1799.4176 | 75.186 |
| 1800.1093 | 65.007 |
| 1800.8009 | 76.914 |
| 1801.4926 | 65.773 |
| 1802.1842 | 77.302 |
| 1802.8759 | 61.321 |
| 1803.5675 | 77.364 |
| 1804.2592 | 72.043 |
| 1804.9508 | 74.098 |
| 1805.6426 | 61.168 |
| 1806.3342 | 77.624 |
| 1807.0259 | 70.806 |
| 1807.7175 | 68.183 |
| 1808.4092 | 75.305 |
| 1809.1008 | 82.266 |
| 1809.7925 | 75 |
| 1810.4841 | 71.78 |
| 1811.1758 | 79.201 |
| 1811.8674 | 75.113 |
| 1812.5592 | 76.277 |
| 1813.2509 | 62.687 |
| 1813.9425 | 68.105 |
| 1814.6342 | 75.398 |
| 1815.3258 | 62.586 |
| 1816.0175 | 75.165 |
| 1816.7091 | 72.154 |
| 1817.4008 | 77.849 |
| 1818.0924 | 67.215 |
| 1818.7842 | 73.731 |
| 1819.4758 | 73.712 |
| 1820.1675 | 70.096 |
| 1820.8591 | 63.019 |
| 1821.5508 | 59.275 |
| 1822.2424 | 62.889 |
| 1822.9341 | 77.156 |
| 1823.6257 | 67.468 |
| 1824.3174 | 82.67 |
| 1825.0092 | 74.526 |
| 1825.7008 | 78.349 |
| 1826.3925 | 45.732 |
| 1827.0841 | 66.01 |
| 1827.7758 | 67.834 |
| 1828.4674 | 69.257 |
| 1829.1591 | 62.473 |
| 1829.8507 | 58.808 |
| 1830.5424 | 70.102 |
| 1831.2341 | 63.637 |
| 1831.9258 | 65.142 |
| 1832.6174 | 62.898 |
| 1833.3091 | 57.529 |
| 1834.0007 | 62.491 |
| 1834.6924 | 69.505 |
| 1835.384 | 60.864 |
| 1836.0757 | 60.393 |
| 1836.7673 | 71.344 |
| 1837.4591 | 66.144 |
| 1838.1508 | 64.37 |
| 1838.8424 | 61.097 |
| 1839.5341 | 67.38 |
| 1840.2257 | 63.089 |
| 1840.9174 | 72.275 |
| 1841.609 | 68.159 |
| 1842.3007 | 78.245 |
| 1842.9923 | 61.516 |
| 1843.684 | 72.129 |
| 1844.3757 | 68.945 |
| 1845.0674 | 66.11 |
| 1845.759 | 54.349 |
| 1846.4507 | 59.153 |
| 1847.1423 | 47.976 |
| 1847.834 | 54.988 |
| 1848.5256 | 59.936 |
| 1849.2173 | 73.345 |
| 1849.9089 | 69.789 |
| 1850.6007 | 55.514 |
| 1851.2924 | 56.047 |
| 1851.984 | 67.265 |
| 1852.6757 | 68.705 |
| 1853.3673 | 61.171 |
| 1854.059 | 66.023 |
| 1854.7506 | 73.975 |
| 1855.4423 | 67.851 |
| 1856.1339 | 67.906 |
| 1856.8257 | 64.269 |
| 1857.5173 | 60.025 |
| 1858.209 | 68.081 |
| 1858.9006 | 54.397 |
| 1859.5923 | 55.21 |
| 1860.2839 | 66.346 |
| 1860.9756 | 67.164 |
| 1861.6672 | 52.976 |
| 1862.3589 | 73.221 |
| 1863.0507 | 75.805 |
| 1863.7423 | 77.451 |
| 1864.434 | 72.743 |
| 1865.1256 | 70.637 |
| 1865.8173 | 77.1 |
| 1866.5089 | 65.666 |
| 1867.2006 | 64.562 |
| 1867.8922 | 61.446 |
| 1868.5839 | 58.269 |
| 1869.2755 | 62.587 |
| 1869.9673 | 72.997 |
| 1870.6589 | 41.211 |
| 1871.3506 | 60.245 |
| 1872.0422 | 70.117 |
| 1872.7339 | 64.16 |
| 1873.4255 | 69.979 |
| 1874.1172 | 75.698 |
| 1874.8088 | 73.022 |
| 1875.5005 | 55.302 |
| 1876.1923 | 54.202 |
| 1876.8839 | 53.747 |
| 1877.5756 | 59.067 |
| 1878.2672 | 59.898 |
| 1878.9589 | 61.609 |
| 1879.6505 | 59.253 |
| 1880.3422 | 55.031 |
| 1881.0338 | 55.277 |
| 1881.7255 | 58.607 |
| 1882.4172 | 49.118 |
| 1883.1089 | 44.637 |
| 1883.8005 | 57.926 |
| 1884.4922 | 51.388 |
| 1885.1838 | 56.53 |
| 1885.8755 | 59.694 |
| 1886.5671 | 58.732 |
| 1887.2588 | 60.442 |
| 1887.9504 | 69.201 |
| 1888.6422 | 45.7 |
| 1889.3339 | 53.423 |
| 1890.0255 | 62.989 |
| 1890.7172 | 67.475 |
| 1891.4088 | 59.879 |
| 1892.1005 | 70.838 |
| 1892.7921 | 43.902 |
| 1893.4838 | 70.731 |
| 1894.1754 | 63.2 |
| 1894.8672 | 64.954 |
| 1895.5588 | 71.046 |
| 1896.2505 | 74.992 |
| 1896.9421 | 58.101 |
| 1897.6338 | 57.476 |
| 1898.3254 | 58.735 |
| 1899.0171 | 64.649 |
| 1899.7087 | 56.68 |
| 1900.4004 | 54.133 |
| 1901.092 | 56.531 |
| 1901.7838 | 55.54 |
| 1902.4755 | 55.806 |
| 1903.1671 | 50.991 |
| 1903.8588 | 69.355 |
| 1904.5504 | 62.533 |
| 1905.2421 | 50.243 |
| 1905.9337 | 55.594 |
| 1906.6254 | 55.258 |
| 1907.317 | 61.474 |
| 1908.0088 | 67.748 |
| 1908.7004 | 48.863 |
| 1909.3921 | 53.369 |
| 1910.0837 | 53.276 |
| 1910.7754 | 61.382 |
| 1911.467 | 57.57 |
| 1912.1587 | 73.241 |
| 1912.8503 | 50.115 |
| 1913.542 | 65.543 |
| 1914.2338 | 56.545 |
| 1914.9254 | 51.206 |
| 1915.6171 | 57.856 |
| 1916.3087 | 65.384 |
| 1917.0004 | 55.748 |
| 1917.692 | 53.372 |
| 1918.3837 | 61.201 |
| 1919.0753 | 69.374 |
| 1919.767 | 59.297 |
| 1920.4587 | 65.288 |
| 1921.1504 | 66.969 |
| 1921.842 | 60.185 |
| 1922.5337 | 62.439 |
| 1923.2253 | 62.237 |
| 1923.917 | 67.299 |
| 1924.6086 | 60.046 |
| 1925.3003 | 55.241 |
| 1925.9919 | 52.748 |
| 1926.6837 | 52.349 |
| 1927.3754 | 53.587 |
| 1928.067 | 57.406 |
| 1928.7587 | 50.034 |
| 1929.4503 | 63.108 |
| 1930.142 | 58.829 |
| 1930.8336 | 49.12 |
| 1931.5253 | 53.03 |
| 1932.2169 | 57.28 |
| 1932.9086 | 48.362 |
| 1933.6003 | 43.345 |
| 1934.292 | 52.489 |
| 1934.9836 | 49.485 |
| 1935.6753 | 44.374 |
| 1936.3669 | 44.637 |
| 1937.0586 | 68.108 |
| 1937.7502 | 62.733 |
| 1938.4419 | 53.615 |
| 1939.1335 | 56.008 |
| 1939.8253 | 59.972 |
| 1940.517 | 45.112 |
| 1941.2086 | 52.918 |
| 1941.9003 | 61.39 |
| 1942.5919 | 61.018 |
| 1943.2836 | 48.003 |
| 1943.9752 | 61.623 |
| 1944.6669 | 59.418 |
| 1945.3585 | 44.232 |
| 1946.0503 | 55.309 |
| 1946.7419 | 44.712 |
| 1947.4336 | 52.948 |
| 1948.1252 | 57.327 |
| 1948.8169 | 45.783 |
| 1949.5085 | 54.564 |
| 1950.2002 | 51.882 |
| 1950.8918 | 53.094 |
| 1951.5835 | 59.879 |
| 1952.2753 | 54.741 |
| 1952.9669 | 47.967 |
| 1953.6586 | 55.156 |
| 1954.3502 | 60.586 |
| 1955.0419 | 62.778 |
| 1955.7335 | 60.655 |
| 1956.4252 | 62.023 |
| 1957.1168 | 53.487 |
| 1957.8085 | 55 |
| 1958.5001 | 48.734 |
| 1959.1919 | 50.914 |
| 1959.8835 | 52.021 |
| 1960.5752 | 62.677 |
| 1961.2668 | 56.196 |
| 1961.9585 | 50.669 |
| 1962.6501 | 55.444 |
| 1963.3418 | 54.017 |
| 1964.0334 | 49.19 |
| 1964.7251 | 58.4 |
| 1965.4169 | 58.208 |
| 1966.1085 | 50.582 |
| 1966.8002 | 54.41 |
| 1967.4918 | 42.154 |
| 1968.1835 | 46.198 |
| 1968.8751 | 48.343 |
| 1969.5668 | 46.231 |
| 1970.2584 | 63.495 |
| 1970.9501 | 58.282 |
| 1971.6418 | 57.665 |
| 1972.3335 | 44.017 |
| 1973.0251 | 63.623 |
| 1973.7168 | 63.666 |
| 1974.4084 | 61.315 |
| 1975.1001 | 57.683 |
| 1975.7917 | 52.804 |
| 1976.4834 | 54.977 |
| 1977.175 | 55.063 |
| 1977.8668 | 48.433 |
| 1978.5585 | 54.139 |
| 1979.2501 | 46.963 |
| 1979.9418 | 54.779 |
| 1980.6334 | 53.279 |
| 1981.3251 | 40.187 |
| 1982.0167 | 58.332 |
| 1982.7084 | 50.929 |
| 1983.4 | 59.921 |
| 1984.0918 | 61.4 |
| 1984.7834 | 45.665 |
| 1985.4751 | 40.009 |
| 1986.1667 | 29.437 |
| 1986.8584 | 60.846 |
| 1987.55 | 49.682 |
| 1988.2417 | 53.452 |
| 1988.9333 | 61.633 |
| 1989.625 | 55.853 |
| 1990.3167 | 58.748 |
| 1991.0084 | 42.931 |
| 1991.7001 | 54.23 |
| 1992.3917 | 41.417 |
| 1993.0834 | 41.246 |
| 1993.775 | 46.653 |
| 1994.4667 | 38 |
| 1995.1583 | 48.019 |
| 1995.85 | 63.601 |
| 1996.5416 | 52.972 |
| 1997.2334 | 56.918 |
| 1997.925 | 40.843 |
| 1998.6167 | 51 |
| 1999.3083 | 51 |
| 2000.0 | 53.727 |